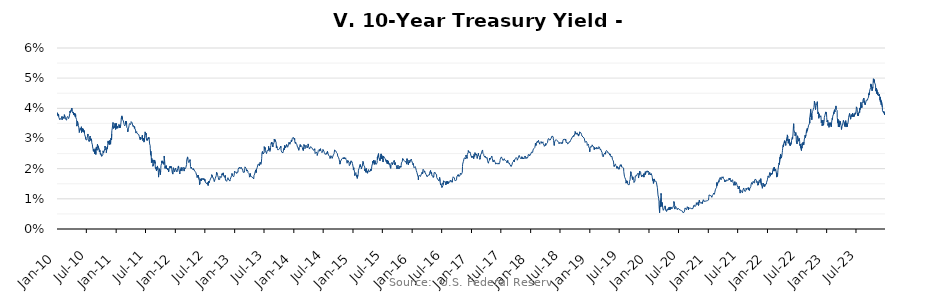
| Category | Series 0 |
|---|---|
| 2010-01-04 | 0.038 |
| 2010-01-05 | 0.038 |
| 2010-01-06 | 0.038 |
| 2010-01-07 | 0.038 |
| 2010-01-08 | 0.038 |
| 2010-01-11 | 0.038 |
| 2010-01-12 | 0.037 |
| 2010-01-13 | 0.038 |
| 2010-01-14 | 0.038 |
| 2010-01-15 | 0.037 |
| 2010-01-19 | 0.037 |
| 2010-01-20 | 0.037 |
| 2010-01-21 | 0.036 |
| 2010-01-22 | 0.036 |
| 2010-01-25 | 0.037 |
| 2010-01-26 | 0.036 |
| 2010-01-27 | 0.037 |
| 2010-01-28 | 0.037 |
| 2010-01-29 | 0.036 |
| 2010-02-01 | 0.037 |
| 2010-02-02 | 0.037 |
| 2010-02-03 | 0.037 |
| 2010-02-04 | 0.036 |
| 2010-02-05 | 0.036 |
| 2010-02-08 | 0.036 |
| 2010-02-09 | 0.037 |
| 2010-02-10 | 0.037 |
| 2010-02-11 | 0.037 |
| 2010-02-12 | 0.037 |
| 2010-02-16 | 0.037 |
| 2010-02-17 | 0.037 |
| 2010-02-18 | 0.038 |
| 2010-02-19 | 0.038 |
| 2010-02-22 | 0.038 |
| 2010-02-23 | 0.037 |
| 2010-02-24 | 0.037 |
| 2010-02-25 | 0.036 |
| 2010-02-26 | 0.036 |
| 2010-03-01 | 0.036 |
| 2010-03-02 | 0.036 |
| 2010-03-03 | 0.036 |
| 2010-03-04 | 0.036 |
| 2010-03-05 | 0.037 |
| 2010-03-08 | 0.037 |
| 2010-03-09 | 0.037 |
| 2010-03-10 | 0.037 |
| 2010-03-11 | 0.037 |
| 2010-03-12 | 0.037 |
| 2010-03-15 | 0.037 |
| 2010-03-16 | 0.037 |
| 2010-03-17 | 0.036 |
| 2010-03-18 | 0.037 |
| 2010-03-19 | 0.037 |
| 2010-03-22 | 0.037 |
| 2010-03-23 | 0.037 |
| 2010-03-24 | 0.038 |
| 2010-03-25 | 0.039 |
| 2010-03-26 | 0.039 |
| 2010-03-29 | 0.039 |
| 2010-03-30 | 0.039 |
| 2010-03-31 | 0.038 |
| 2010-04-01 | 0.039 |
| 2010-04-02 | 0.04 |
| 2010-04-05 | 0.04 |
| 2010-04-06 | 0.04 |
| 2010-04-07 | 0.039 |
| 2010-04-08 | 0.039 |
| 2010-04-09 | 0.039 |
| 2010-04-12 | 0.039 |
| 2010-04-13 | 0.038 |
| 2010-04-14 | 0.039 |
| 2010-04-15 | 0.039 |
| 2010-04-16 | 0.038 |
| 2010-04-19 | 0.038 |
| 2010-04-20 | 0.038 |
| 2010-04-21 | 0.038 |
| 2010-04-22 | 0.038 |
| 2010-04-23 | 0.038 |
| 2010-04-26 | 0.038 |
| 2010-04-27 | 0.037 |
| 2010-04-28 | 0.038 |
| 2010-04-29 | 0.038 |
| 2010-04-30 | 0.037 |
| 2010-05-03 | 0.037 |
| 2010-05-04 | 0.036 |
| 2010-05-05 | 0.036 |
| 2010-05-06 | 0.034 |
| 2010-05-07 | 0.034 |
| 2010-05-10 | 0.036 |
| 2010-05-11 | 0.036 |
| 2010-05-12 | 0.036 |
| 2010-05-13 | 0.036 |
| 2010-05-14 | 0.034 |
| 2010-05-17 | 0.035 |
| 2010-05-18 | 0.034 |
| 2010-05-19 | 0.034 |
| 2010-05-20 | 0.032 |
| 2010-05-21 | 0.032 |
| 2010-05-24 | 0.032 |
| 2010-05-25 | 0.032 |
| 2010-05-26 | 0.032 |
| 2010-05-27 | 0.033 |
| 2010-05-28 | 0.033 |
| 2010-06-01 | 0.033 |
| 2010-06-02 | 0.034 |
| 2010-06-03 | 0.034 |
| 2010-06-04 | 0.032 |
| 2010-06-07 | 0.032 |
| 2010-06-08 | 0.032 |
| 2010-06-09 | 0.032 |
| 2010-06-10 | 0.033 |
| 2010-06-11 | 0.032 |
| 2010-06-14 | 0.033 |
| 2010-06-15 | 0.033 |
| 2010-06-16 | 0.033 |
| 2010-06-17 | 0.032 |
| 2010-06-18 | 0.032 |
| 2010-06-21 | 0.033 |
| 2010-06-22 | 0.032 |
| 2010-06-23 | 0.031 |
| 2010-06-24 | 0.031 |
| 2010-06-25 | 0.031 |
| 2010-06-28 | 0.03 |
| 2010-06-29 | 0.03 |
| 2010-06-30 | 0.03 |
| 2010-07-01 | 0.03 |
| 2010-07-02 | 0.03 |
| 2010-07-06 | 0.03 |
| 2010-07-07 | 0.03 |
| 2010-07-08 | 0.03 |
| 2010-07-09 | 0.031 |
| 2010-07-12 | 0.031 |
| 2010-07-13 | 0.032 |
| 2010-07-14 | 0.031 |
| 2010-07-15 | 0.03 |
| 2010-07-16 | 0.03 |
| 2010-07-19 | 0.03 |
| 2010-07-20 | 0.03 |
| 2010-07-21 | 0.029 |
| 2010-07-22 | 0.03 |
| 2010-07-23 | 0.03 |
| 2010-07-26 | 0.03 |
| 2010-07-27 | 0.031 |
| 2010-07-28 | 0.03 |
| 2010-07-29 | 0.03 |
| 2010-07-30 | 0.029 |
| 2010-08-02 | 0.03 |
| 2010-08-03 | 0.029 |
| 2010-08-04 | 0.03 |
| 2010-08-05 | 0.029 |
| 2010-08-06 | 0.029 |
| 2010-08-09 | 0.029 |
| 2010-08-10 | 0.028 |
| 2010-08-11 | 0.027 |
| 2010-08-12 | 0.027 |
| 2010-08-13 | 0.027 |
| 2010-08-16 | 0.026 |
| 2010-08-17 | 0.026 |
| 2010-08-18 | 0.026 |
| 2010-08-19 | 0.026 |
| 2010-08-20 | 0.026 |
| 2010-08-23 | 0.026 |
| 2010-08-24 | 0.025 |
| 2010-08-25 | 0.025 |
| 2010-08-26 | 0.025 |
| 2010-08-27 | 0.027 |
| 2010-08-30 | 0.025 |
| 2010-08-31 | 0.025 |
| 2010-09-01 | 0.026 |
| 2010-09-02 | 0.026 |
| 2010-09-03 | 0.027 |
| 2010-09-07 | 0.026 |
| 2010-09-08 | 0.027 |
| 2010-09-09 | 0.028 |
| 2010-09-10 | 0.028 |
| 2010-09-13 | 0.027 |
| 2010-09-14 | 0.027 |
| 2010-09-15 | 0.027 |
| 2010-09-16 | 0.028 |
| 2010-09-17 | 0.028 |
| 2010-09-20 | 0.027 |
| 2010-09-21 | 0.026 |
| 2010-09-22 | 0.026 |
| 2010-09-23 | 0.026 |
| 2010-09-24 | 0.026 |
| 2010-09-27 | 0.025 |
| 2010-09-28 | 0.025 |
| 2010-09-29 | 0.025 |
| 2010-09-30 | 0.025 |
| 2010-10-01 | 0.025 |
| 2010-10-04 | 0.025 |
| 2010-10-05 | 0.025 |
| 2010-10-06 | 0.024 |
| 2010-10-07 | 0.024 |
| 2010-10-08 | 0.024 |
| 2010-10-12 | 0.024 |
| 2010-10-13 | 0.025 |
| 2010-10-14 | 0.025 |
| 2010-10-15 | 0.026 |
| 2010-10-18 | 0.025 |
| 2010-10-19 | 0.025 |
| 2010-10-20 | 0.025 |
| 2010-10-21 | 0.026 |
| 2010-10-22 | 0.026 |
| 2010-10-25 | 0.026 |
| 2010-10-26 | 0.027 |
| 2010-10-27 | 0.028 |
| 2010-10-28 | 0.027 |
| 2010-10-29 | 0.026 |
| 2010-11-01 | 0.027 |
| 2010-11-02 | 0.026 |
| 2010-11-03 | 0.027 |
| 2010-11-04 | 0.025 |
| 2010-11-05 | 0.026 |
| 2010-11-08 | 0.026 |
| 2010-11-09 | 0.027 |
| 2010-11-10 | 0.026 |
| 2010-11-12 | 0.028 |
| 2010-11-15 | 0.029 |
| 2010-11-16 | 0.028 |
| 2010-11-17 | 0.029 |
| 2010-11-18 | 0.029 |
| 2010-11-19 | 0.029 |
| 2010-11-22 | 0.028 |
| 2010-11-23 | 0.028 |
| 2010-11-24 | 0.029 |
| 2010-11-26 | 0.029 |
| 2010-11-29 | 0.028 |
| 2010-11-30 | 0.028 |
| 2010-12-01 | 0.03 |
| 2010-12-02 | 0.03 |
| 2010-12-03 | 0.03 |
| 2010-12-06 | 0.03 |
| 2010-12-07 | 0.032 |
| 2010-12-08 | 0.033 |
| 2010-12-09 | 0.032 |
| 2010-12-10 | 0.033 |
| 2010-12-13 | 0.033 |
| 2010-12-14 | 0.035 |
| 2010-12-15 | 0.035 |
| 2010-12-16 | 0.035 |
| 2010-12-17 | 0.033 |
| 2010-12-20 | 0.034 |
| 2010-12-21 | 0.034 |
| 2010-12-22 | 0.034 |
| 2010-12-23 | 0.034 |
| 2010-12-27 | 0.034 |
| 2010-12-28 | 0.035 |
| 2010-12-29 | 0.034 |
| 2010-12-30 | 0.034 |
| 2010-12-31 | 0.033 |
| 2011-01-03 | 0.034 |
| 2011-01-04 | 0.034 |
| 2011-01-05 | 0.035 |
| 2011-01-06 | 0.034 |
| 2011-01-07 | 0.033 |
| 2011-01-10 | 0.033 |
| 2011-01-11 | 0.034 |
| 2011-01-12 | 0.034 |
| 2011-01-13 | 0.033 |
| 2011-01-14 | 0.034 |
| 2011-01-18 | 0.034 |
| 2011-01-19 | 0.034 |
| 2011-01-20 | 0.035 |
| 2011-01-21 | 0.034 |
| 2011-01-24 | 0.034 |
| 2011-01-25 | 0.034 |
| 2011-01-26 | 0.034 |
| 2011-01-27 | 0.034 |
| 2011-01-28 | 0.034 |
| 2011-01-31 | 0.034 |
| 2011-02-01 | 0.035 |
| 2011-02-02 | 0.035 |
| 2011-02-03 | 0.036 |
| 2011-02-04 | 0.037 |
| 2011-02-07 | 0.037 |
| 2011-02-08 | 0.038 |
| 2011-02-09 | 0.036 |
| 2011-02-10 | 0.037 |
| 2011-02-11 | 0.036 |
| 2011-02-14 | 0.036 |
| 2011-02-15 | 0.036 |
| 2011-02-16 | 0.036 |
| 2011-02-17 | 0.036 |
| 2011-02-18 | 0.036 |
| 2011-02-22 | 0.035 |
| 2011-02-23 | 0.035 |
| 2011-02-24 | 0.035 |
| 2011-02-25 | 0.034 |
| 2011-02-28 | 0.034 |
| 2011-03-01 | 0.034 |
| 2011-03-02 | 0.035 |
| 2011-03-03 | 0.036 |
| 2011-03-04 | 0.035 |
| 2011-03-07 | 0.035 |
| 2011-03-08 | 0.036 |
| 2011-03-09 | 0.035 |
| 2011-03-10 | 0.034 |
| 2011-03-11 | 0.034 |
| 2011-03-14 | 0.034 |
| 2011-03-15 | 0.033 |
| 2011-03-16 | 0.032 |
| 2011-03-17 | 0.032 |
| 2011-03-18 | 0.033 |
| 2011-03-21 | 0.033 |
| 2011-03-22 | 0.033 |
| 2011-03-23 | 0.034 |
| 2011-03-24 | 0.034 |
| 2011-03-25 | 0.035 |
| 2011-03-28 | 0.035 |
| 2011-03-29 | 0.035 |
| 2011-03-30 | 0.035 |
| 2011-03-31 | 0.035 |
| 2011-04-01 | 0.035 |
| 2011-04-04 | 0.034 |
| 2011-04-05 | 0.035 |
| 2011-04-06 | 0.036 |
| 2011-04-07 | 0.036 |
| 2011-04-08 | 0.036 |
| 2011-04-11 | 0.036 |
| 2011-04-12 | 0.035 |
| 2011-04-13 | 0.035 |
| 2011-04-14 | 0.035 |
| 2011-04-15 | 0.034 |
| 2011-04-18 | 0.034 |
| 2011-04-19 | 0.034 |
| 2011-04-20 | 0.034 |
| 2011-04-21 | 0.034 |
| 2011-04-25 | 0.034 |
| 2011-04-26 | 0.033 |
| 2011-04-27 | 0.034 |
| 2011-04-28 | 0.033 |
| 2011-04-29 | 0.033 |
| 2011-05-02 | 0.033 |
| 2011-05-03 | 0.033 |
| 2011-05-04 | 0.032 |
| 2011-05-05 | 0.032 |
| 2011-05-06 | 0.032 |
| 2011-05-09 | 0.032 |
| 2011-05-10 | 0.032 |
| 2011-05-11 | 0.032 |
| 2011-05-12 | 0.032 |
| 2011-05-13 | 0.032 |
| 2011-05-16 | 0.032 |
| 2011-05-17 | 0.031 |
| 2011-05-18 | 0.032 |
| 2011-05-19 | 0.032 |
| 2011-05-20 | 0.032 |
| 2011-05-23 | 0.031 |
| 2011-05-24 | 0.031 |
| 2011-05-25 | 0.031 |
| 2011-05-26 | 0.031 |
| 2011-05-27 | 0.031 |
| 2011-05-31 | 0.03 |
| 2011-06-01 | 0.03 |
| 2011-06-02 | 0.03 |
| 2011-06-03 | 0.03 |
| 2011-06-06 | 0.03 |
| 2011-06-07 | 0.03 |
| 2011-06-08 | 0.03 |
| 2011-06-09 | 0.03 |
| 2011-06-10 | 0.03 |
| 2011-06-13 | 0.03 |
| 2011-06-14 | 0.031 |
| 2011-06-15 | 0.03 |
| 2011-06-16 | 0.029 |
| 2011-06-17 | 0.029 |
| 2011-06-20 | 0.03 |
| 2011-06-21 | 0.03 |
| 2011-06-22 | 0.03 |
| 2011-06-23 | 0.029 |
| 2011-06-24 | 0.029 |
| 2011-06-27 | 0.03 |
| 2011-06-28 | 0.03 |
| 2011-06-29 | 0.031 |
| 2011-06-30 | 0.032 |
| 2011-07-01 | 0.032 |
| 2011-07-05 | 0.032 |
| 2011-07-06 | 0.031 |
| 2011-07-07 | 0.032 |
| 2011-07-08 | 0.03 |
| 2011-07-11 | 0.029 |
| 2011-07-12 | 0.029 |
| 2011-07-13 | 0.029 |
| 2011-07-14 | 0.03 |
| 2011-07-15 | 0.029 |
| 2011-07-18 | 0.029 |
| 2011-07-19 | 0.029 |
| 2011-07-20 | 0.03 |
| 2011-07-21 | 0.03 |
| 2011-07-22 | 0.03 |
| 2011-07-25 | 0.03 |
| 2011-07-26 | 0.03 |
| 2011-07-27 | 0.03 |
| 2011-07-28 | 0.03 |
| 2011-07-29 | 0.028 |
| 2011-08-01 | 0.028 |
| 2011-08-02 | 0.027 |
| 2011-08-03 | 0.026 |
| 2011-08-04 | 0.025 |
| 2011-08-05 | 0.026 |
| 2011-08-08 | 0.024 |
| 2011-08-09 | 0.022 |
| 2011-08-10 | 0.022 |
| 2011-08-11 | 0.023 |
| 2011-08-12 | 0.022 |
| 2011-08-15 | 0.023 |
| 2011-08-16 | 0.022 |
| 2011-08-17 | 0.022 |
| 2011-08-18 | 0.021 |
| 2011-08-19 | 0.021 |
| 2011-08-22 | 0.021 |
| 2011-08-23 | 0.022 |
| 2011-08-24 | 0.023 |
| 2011-08-25 | 0.022 |
| 2011-08-26 | 0.022 |
| 2011-08-29 | 0.023 |
| 2011-08-30 | 0.022 |
| 2011-08-31 | 0.022 |
| 2011-09-01 | 0.022 |
| 2011-09-02 | 0.02 |
| 2011-09-06 | 0.02 |
| 2011-09-07 | 0.02 |
| 2011-09-08 | 0.02 |
| 2011-09-09 | 0.019 |
| 2011-09-12 | 0.019 |
| 2011-09-13 | 0.02 |
| 2011-09-14 | 0.02 |
| 2011-09-15 | 0.021 |
| 2011-09-16 | 0.021 |
| 2011-09-19 | 0.02 |
| 2011-09-20 | 0.02 |
| 2011-09-21 | 0.019 |
| 2011-09-22 | 0.017 |
| 2011-09-23 | 0.018 |
| 2011-09-26 | 0.019 |
| 2011-09-27 | 0.02 |
| 2011-09-28 | 0.02 |
| 2011-09-29 | 0.02 |
| 2011-09-30 | 0.019 |
| 2011-10-03 | 0.018 |
| 2011-10-04 | 0.018 |
| 2011-10-05 | 0.019 |
| 2011-10-06 | 0.02 |
| 2011-10-07 | 0.021 |
| 2011-10-11 | 0.022 |
| 2011-10-12 | 0.022 |
| 2011-10-13 | 0.022 |
| 2011-10-14 | 0.023 |
| 2011-10-17 | 0.022 |
| 2011-10-18 | 0.022 |
| 2011-10-19 | 0.022 |
| 2011-10-20 | 0.022 |
| 2011-10-21 | 0.022 |
| 2011-10-24 | 0.022 |
| 2011-10-25 | 0.021 |
| 2011-10-26 | 0.022 |
| 2011-10-27 | 0.024 |
| 2011-10-28 | 0.023 |
| 2011-10-31 | 0.022 |
| 2011-11-01 | 0.02 |
| 2011-11-02 | 0.02 |
| 2011-11-03 | 0.021 |
| 2011-11-04 | 0.021 |
| 2011-11-07 | 0.02 |
| 2011-11-08 | 0.021 |
| 2011-11-09 | 0.02 |
| 2011-11-10 | 0.02 |
| 2011-11-14 | 0.02 |
| 2011-11-15 | 0.021 |
| 2011-11-16 | 0.02 |
| 2011-11-17 | 0.02 |
| 2011-11-18 | 0.02 |
| 2011-11-21 | 0.02 |
| 2011-11-22 | 0.019 |
| 2011-11-23 | 0.019 |
| 2011-11-25 | 0.02 |
| 2011-11-28 | 0.02 |
| 2011-11-29 | 0.02 |
| 2011-11-30 | 0.021 |
| 2011-12-01 | 0.021 |
| 2011-12-02 | 0.02 |
| 2011-12-05 | 0.02 |
| 2011-12-06 | 0.021 |
| 2011-12-07 | 0.02 |
| 2011-12-08 | 0.02 |
| 2011-12-09 | 0.021 |
| 2011-12-12 | 0.02 |
| 2011-12-13 | 0.02 |
| 2011-12-14 | 0.019 |
| 2011-12-15 | 0.019 |
| 2011-12-16 | 0.019 |
| 2011-12-19 | 0.018 |
| 2011-12-20 | 0.019 |
| 2011-12-21 | 0.02 |
| 2011-12-22 | 0.02 |
| 2011-12-23 | 0.02 |
| 2011-12-27 | 0.02 |
| 2011-12-28 | 0.019 |
| 2011-12-29 | 0.019 |
| 2011-12-30 | 0.019 |
| 2012-01-02 | 0.019 |
| 2012-01-03 | 0.02 |
| 2012-01-04 | 0.02 |
| 2012-01-05 | 0.02 |
| 2012-01-06 | 0.02 |
| 2012-01-09 | 0.02 |
| 2012-01-10 | 0.02 |
| 2012-01-11 | 0.019 |
| 2012-01-12 | 0.019 |
| 2012-01-13 | 0.019 |
| 2012-01-16 | 0.019 |
| 2012-01-17 | 0.019 |
| 2012-01-18 | 0.019 |
| 2012-01-19 | 0.02 |
| 2012-01-20 | 0.02 |
| 2012-01-23 | 0.021 |
| 2012-01-24 | 0.021 |
| 2012-01-25 | 0.02 |
| 2012-01-26 | 0.02 |
| 2012-01-27 | 0.019 |
| 2012-01-30 | 0.019 |
| 2012-01-31 | 0.018 |
| 2012-02-01 | 0.019 |
| 2012-02-02 | 0.019 |
| 2012-02-03 | 0.02 |
| 2012-02-06 | 0.019 |
| 2012-02-07 | 0.02 |
| 2012-02-08 | 0.02 |
| 2012-02-09 | 0.02 |
| 2012-02-10 | 0.02 |
| 2012-02-13 | 0.02 |
| 2012-02-14 | 0.019 |
| 2012-02-15 | 0.019 |
| 2012-02-16 | 0.02 |
| 2012-02-17 | 0.02 |
| 2012-02-20 | 0.02 |
| 2012-02-21 | 0.02 |
| 2012-02-22 | 0.02 |
| 2012-02-23 | 0.02 |
| 2012-02-24 | 0.02 |
| 2012-02-27 | 0.019 |
| 2012-02-28 | 0.019 |
| 2012-02-29 | 0.02 |
| 2012-03-01 | 0.02 |
| 2012-03-02 | 0.02 |
| 2012-03-05 | 0.02 |
| 2012-03-06 | 0.02 |
| 2012-03-07 | 0.02 |
| 2012-03-08 | 0.02 |
| 2012-03-09 | 0.02 |
| 2012-03-12 | 0.02 |
| 2012-03-13 | 0.021 |
| 2012-03-14 | 0.023 |
| 2012-03-15 | 0.023 |
| 2012-03-16 | 0.023 |
| 2012-03-19 | 0.024 |
| 2012-03-20 | 0.024 |
| 2012-03-21 | 0.023 |
| 2012-03-22 | 0.023 |
| 2012-03-23 | 0.022 |
| 2012-03-26 | 0.023 |
| 2012-03-27 | 0.022 |
| 2012-03-28 | 0.022 |
| 2012-03-29 | 0.022 |
| 2012-03-30 | 0.022 |
| 2012-04-02 | 0.022 |
| 2012-04-03 | 0.023 |
| 2012-04-04 | 0.022 |
| 2012-04-05 | 0.022 |
| 2012-04-06 | 0.021 |
| 2012-04-09 | 0.021 |
| 2012-04-10 | 0.02 |
| 2012-04-11 | 0.02 |
| 2012-04-12 | 0.021 |
| 2012-04-13 | 0.02 |
| 2012-04-16 | 0.02 |
| 2012-04-17 | 0.02 |
| 2012-04-18 | 0.02 |
| 2012-04-19 | 0.02 |
| 2012-04-20 | 0.02 |
| 2012-04-23 | 0.02 |
| 2012-04-24 | 0.02 |
| 2012-04-25 | 0.02 |
| 2012-04-26 | 0.02 |
| 2012-04-27 | 0.02 |
| 2012-04-30 | 0.02 |
| 2012-05-01 | 0.02 |
| 2012-05-02 | 0.02 |
| 2012-05-03 | 0.02 |
| 2012-05-04 | 0.019 |
| 2012-05-07 | 0.019 |
| 2012-05-08 | 0.019 |
| 2012-05-09 | 0.019 |
| 2012-05-10 | 0.019 |
| 2012-05-11 | 0.018 |
| 2012-05-14 | 0.018 |
| 2012-05-15 | 0.018 |
| 2012-05-16 | 0.018 |
| 2012-05-17 | 0.017 |
| 2012-05-18 | 0.017 |
| 2012-05-21 | 0.018 |
| 2012-05-22 | 0.018 |
| 2012-05-23 | 0.017 |
| 2012-05-24 | 0.018 |
| 2012-05-25 | 0.018 |
| 2012-05-28 | 0.018 |
| 2012-05-29 | 0.017 |
| 2012-05-30 | 0.016 |
| 2012-05-31 | 0.016 |
| 2012-06-01 | 0.015 |
| 2012-06-04 | 0.015 |
| 2012-06-05 | 0.016 |
| 2012-06-06 | 0.017 |
| 2012-06-07 | 0.017 |
| 2012-06-08 | 0.016 |
| 2012-06-11 | 0.016 |
| 2012-06-12 | 0.017 |
| 2012-06-13 | 0.016 |
| 2012-06-14 | 0.016 |
| 2012-06-15 | 0.016 |
| 2012-06-18 | 0.016 |
| 2012-06-19 | 0.016 |
| 2012-06-20 | 0.016 |
| 2012-06-21 | 0.016 |
| 2012-06-22 | 0.017 |
| 2012-06-25 | 0.016 |
| 2012-06-26 | 0.017 |
| 2012-06-27 | 0.016 |
| 2012-06-28 | 0.016 |
| 2012-06-29 | 0.017 |
| 2012-07-02 | 0.016 |
| 2012-07-03 | 0.016 |
| 2012-07-04 | 0.016 |
| 2012-07-05 | 0.016 |
| 2012-07-06 | 0.016 |
| 2012-07-09 | 0.015 |
| 2012-07-10 | 0.015 |
| 2012-07-11 | 0.015 |
| 2012-07-12 | 0.015 |
| 2012-07-13 | 0.015 |
| 2012-07-16 | 0.015 |
| 2012-07-17 | 0.015 |
| 2012-07-18 | 0.015 |
| 2012-07-19 | 0.015 |
| 2012-07-20 | 0.015 |
| 2012-07-23 | 0.015 |
| 2012-07-24 | 0.014 |
| 2012-07-25 | 0.014 |
| 2012-07-26 | 0.014 |
| 2012-07-27 | 0.016 |
| 2012-07-30 | 0.015 |
| 2012-07-31 | 0.015 |
| 2012-08-01 | 0.016 |
| 2012-08-02 | 0.015 |
| 2012-08-03 | 0.016 |
| 2012-08-06 | 0.016 |
| 2012-08-07 | 0.017 |
| 2012-08-08 | 0.017 |
| 2012-08-09 | 0.017 |
| 2012-08-10 | 0.016 |
| 2012-08-13 | 0.016 |
| 2012-08-14 | 0.017 |
| 2012-08-15 | 0.018 |
| 2012-08-16 | 0.018 |
| 2012-08-17 | 0.018 |
| 2012-08-20 | 0.018 |
| 2012-08-21 | 0.018 |
| 2012-08-22 | 0.017 |
| 2012-08-23 | 0.017 |
| 2012-08-24 | 0.017 |
| 2012-08-27 | 0.016 |
| 2012-08-28 | 0.016 |
| 2012-08-29 | 0.017 |
| 2012-08-30 | 0.016 |
| 2012-08-31 | 0.016 |
| 2012-09-03 | 0.016 |
| 2012-09-04 | 0.016 |
| 2012-09-05 | 0.016 |
| 2012-09-06 | 0.017 |
| 2012-09-07 | 0.017 |
| 2012-09-10 | 0.017 |
| 2012-09-11 | 0.017 |
| 2012-09-12 | 0.018 |
| 2012-09-13 | 0.018 |
| 2012-09-14 | 0.019 |
| 2012-09-17 | 0.019 |
| 2012-09-18 | 0.018 |
| 2012-09-19 | 0.018 |
| 2012-09-20 | 0.018 |
| 2012-09-21 | 0.018 |
| 2012-09-24 | 0.017 |
| 2012-09-25 | 0.017 |
| 2012-09-26 | 0.016 |
| 2012-09-27 | 0.017 |
| 2012-09-28 | 0.016 |
| 2012-10-01 | 0.016 |
| 2012-10-02 | 0.016 |
| 2012-10-03 | 0.016 |
| 2012-10-04 | 0.017 |
| 2012-10-05 | 0.018 |
| 2012-10-08 | 0.018 |
| 2012-10-09 | 0.017 |
| 2012-10-10 | 0.017 |
| 2012-10-11 | 0.017 |
| 2012-10-12 | 0.017 |
| 2012-10-15 | 0.017 |
| 2012-10-16 | 0.018 |
| 2012-10-17 | 0.018 |
| 2012-10-18 | 0.019 |
| 2012-10-19 | 0.018 |
| 2012-10-22 | 0.018 |
| 2012-10-23 | 0.018 |
| 2012-10-24 | 0.018 |
| 2012-10-25 | 0.019 |
| 2012-10-26 | 0.018 |
| 2012-10-29 | 0.017 |
| 2012-10-30 | 0.017 |
| 2012-10-31 | 0.017 |
| 2012-11-01 | 0.018 |
| 2012-11-02 | 0.018 |
| 2012-11-05 | 0.017 |
| 2012-11-06 | 0.018 |
| 2012-11-07 | 0.017 |
| 2012-11-08 | 0.016 |
| 2012-11-09 | 0.016 |
| 2012-11-12 | 0.016 |
| 2012-11-13 | 0.016 |
| 2012-11-14 | 0.016 |
| 2012-11-15 | 0.016 |
| 2012-11-16 | 0.016 |
| 2012-11-19 | 0.016 |
| 2012-11-20 | 0.017 |
| 2012-11-21 | 0.017 |
| 2012-11-22 | 0.017 |
| 2012-11-23 | 0.017 |
| 2012-11-26 | 0.017 |
| 2012-11-27 | 0.016 |
| 2012-11-28 | 0.016 |
| 2012-11-29 | 0.016 |
| 2012-11-30 | 0.016 |
| 2012-12-03 | 0.016 |
| 2012-12-04 | 0.016 |
| 2012-12-05 | 0.016 |
| 2012-12-06 | 0.016 |
| 2012-12-07 | 0.016 |
| 2012-12-10 | 0.016 |
| 2012-12-11 | 0.017 |
| 2012-12-12 | 0.017 |
| 2012-12-13 | 0.017 |
| 2012-12-14 | 0.017 |
| 2012-12-17 | 0.018 |
| 2012-12-18 | 0.018 |
| 2012-12-19 | 0.018 |
| 2012-12-20 | 0.018 |
| 2012-12-21 | 0.018 |
| 2012-12-24 | 0.018 |
| 2012-12-25 | 0.018 |
| 2012-12-26 | 0.018 |
| 2012-12-27 | 0.017 |
| 2012-12-28 | 0.017 |
| 2012-12-31 | 0.018 |
| 2013-01-01 | 0.018 |
| 2013-01-02 | 0.019 |
| 2013-01-03 | 0.019 |
| 2013-01-04 | 0.019 |
| 2013-01-07 | 0.019 |
| 2013-01-08 | 0.019 |
| 2013-01-09 | 0.019 |
| 2013-01-10 | 0.019 |
| 2013-01-11 | 0.019 |
| 2013-01-14 | 0.019 |
| 2013-01-15 | 0.019 |
| 2013-01-16 | 0.018 |
| 2013-01-17 | 0.019 |
| 2013-01-18 | 0.019 |
| 2013-01-21 | 0.019 |
| 2013-01-22 | 0.019 |
| 2013-01-23 | 0.019 |
| 2013-01-24 | 0.019 |
| 2013-01-25 | 0.02 |
| 2013-01-28 | 0.02 |
| 2013-01-29 | 0.02 |
| 2013-01-30 | 0.02 |
| 2013-01-31 | 0.02 |
| 2013-02-01 | 0.02 |
| 2013-02-04 | 0.02 |
| 2013-02-05 | 0.02 |
| 2013-02-06 | 0.02 |
| 2013-02-07 | 0.02 |
| 2013-02-08 | 0.02 |
| 2013-02-11 | 0.02 |
| 2013-02-12 | 0.02 |
| 2013-02-13 | 0.02 |
| 2013-02-14 | 0.02 |
| 2013-02-15 | 0.02 |
| 2013-02-18 | 0.02 |
| 2013-02-19 | 0.02 |
| 2013-02-20 | 0.02 |
| 2013-02-21 | 0.02 |
| 2013-02-22 | 0.02 |
| 2013-02-25 | 0.019 |
| 2013-02-26 | 0.019 |
| 2013-02-27 | 0.019 |
| 2013-02-28 | 0.019 |
| 2013-03-01 | 0.019 |
| 2013-03-04 | 0.019 |
| 2013-03-05 | 0.019 |
| 2013-03-06 | 0.02 |
| 2013-03-07 | 0.02 |
| 2013-03-08 | 0.021 |
| 2013-03-11 | 0.021 |
| 2013-03-12 | 0.02 |
| 2013-03-13 | 0.02 |
| 2013-03-14 | 0.02 |
| 2013-03-15 | 0.02 |
| 2013-03-18 | 0.02 |
| 2013-03-19 | 0.019 |
| 2013-03-20 | 0.02 |
| 2013-03-21 | 0.02 |
| 2013-03-22 | 0.019 |
| 2013-03-25 | 0.019 |
| 2013-03-26 | 0.019 |
| 2013-03-27 | 0.019 |
| 2013-03-28 | 0.019 |
| 2013-03-29 | 0.019 |
| 2013-04-01 | 0.019 |
| 2013-04-02 | 0.019 |
| 2013-04-03 | 0.018 |
| 2013-04-04 | 0.018 |
| 2013-04-05 | 0.017 |
| 2013-04-08 | 0.018 |
| 2013-04-09 | 0.018 |
| 2013-04-10 | 0.018 |
| 2013-04-11 | 0.018 |
| 2013-04-12 | 0.018 |
| 2013-04-15 | 0.017 |
| 2013-04-16 | 0.018 |
| 2013-04-17 | 0.017 |
| 2013-04-18 | 0.017 |
| 2013-04-19 | 0.017 |
| 2013-04-22 | 0.017 |
| 2013-04-23 | 0.017 |
| 2013-04-24 | 0.017 |
| 2013-04-25 | 0.017 |
| 2013-04-26 | 0.017 |
| 2013-04-29 | 0.017 |
| 2013-04-30 | 0.017 |
| 2013-05-01 | 0.017 |
| 2013-05-02 | 0.017 |
| 2013-05-03 | 0.018 |
| 2013-05-06 | 0.018 |
| 2013-05-07 | 0.018 |
| 2013-05-08 | 0.018 |
| 2013-05-09 | 0.018 |
| 2013-05-10 | 0.019 |
| 2013-05-13 | 0.019 |
| 2013-05-14 | 0.02 |
| 2013-05-15 | 0.019 |
| 2013-05-16 | 0.019 |
| 2013-05-17 | 0.02 |
| 2013-05-20 | 0.02 |
| 2013-05-21 | 0.019 |
| 2013-05-22 | 0.02 |
| 2013-05-23 | 0.02 |
| 2013-05-24 | 0.02 |
| 2013-05-27 | 0.02 |
| 2013-05-28 | 0.022 |
| 2013-05-29 | 0.021 |
| 2013-05-30 | 0.021 |
| 2013-05-31 | 0.022 |
| 2013-06-03 | 0.021 |
| 2013-06-04 | 0.021 |
| 2013-06-05 | 0.021 |
| 2013-06-06 | 0.021 |
| 2013-06-07 | 0.022 |
| 2013-06-10 | 0.022 |
| 2013-06-11 | 0.022 |
| 2013-06-12 | 0.022 |
| 2013-06-13 | 0.022 |
| 2013-06-14 | 0.021 |
| 2013-06-17 | 0.022 |
| 2013-06-18 | 0.022 |
| 2013-06-19 | 0.023 |
| 2013-06-20 | 0.024 |
| 2013-06-21 | 0.025 |
| 2013-06-24 | 0.026 |
| 2013-06-25 | 0.026 |
| 2013-06-26 | 0.026 |
| 2013-06-27 | 0.025 |
| 2013-06-28 | 0.025 |
| 2013-07-01 | 0.025 |
| 2013-07-02 | 0.025 |
| 2013-07-03 | 0.025 |
| 2013-07-04 | 0.025 |
| 2013-07-05 | 0.027 |
| 2013-07-08 | 0.026 |
| 2013-07-09 | 0.026 |
| 2013-07-10 | 0.027 |
| 2013-07-11 | 0.026 |
| 2013-07-12 | 0.026 |
| 2013-07-15 | 0.026 |
| 2013-07-16 | 0.026 |
| 2013-07-17 | 0.025 |
| 2013-07-18 | 0.026 |
| 2013-07-19 | 0.025 |
| 2013-07-22 | 0.025 |
| 2013-07-23 | 0.025 |
| 2013-07-24 | 0.026 |
| 2013-07-25 | 0.026 |
| 2013-07-26 | 0.026 |
| 2013-07-29 | 0.026 |
| 2013-07-30 | 0.026 |
| 2013-07-31 | 0.026 |
| 2013-08-01 | 0.027 |
| 2013-08-02 | 0.026 |
| 2013-08-05 | 0.027 |
| 2013-08-06 | 0.027 |
| 2013-08-07 | 0.026 |
| 2013-08-08 | 0.026 |
| 2013-08-09 | 0.026 |
| 2013-08-12 | 0.026 |
| 2013-08-13 | 0.027 |
| 2013-08-14 | 0.027 |
| 2013-08-15 | 0.028 |
| 2013-08-16 | 0.028 |
| 2013-08-19 | 0.029 |
| 2013-08-20 | 0.028 |
| 2013-08-21 | 0.029 |
| 2013-08-22 | 0.029 |
| 2013-08-23 | 0.028 |
| 2013-08-26 | 0.028 |
| 2013-08-27 | 0.027 |
| 2013-08-28 | 0.028 |
| 2013-08-29 | 0.028 |
| 2013-08-30 | 0.028 |
| 2013-09-02 | 0.028 |
| 2013-09-03 | 0.029 |
| 2013-09-04 | 0.029 |
| 2013-09-05 | 0.03 |
| 2013-09-06 | 0.029 |
| 2013-09-09 | 0.029 |
| 2013-09-10 | 0.03 |
| 2013-09-11 | 0.029 |
| 2013-09-12 | 0.029 |
| 2013-09-13 | 0.029 |
| 2013-09-16 | 0.029 |
| 2013-09-17 | 0.029 |
| 2013-09-18 | 0.027 |
| 2013-09-19 | 0.028 |
| 2013-09-20 | 0.028 |
| 2013-09-23 | 0.027 |
| 2013-09-24 | 0.027 |
| 2013-09-25 | 0.026 |
| 2013-09-26 | 0.027 |
| 2013-09-27 | 0.026 |
| 2013-09-30 | 0.026 |
| 2013-10-01 | 0.027 |
| 2013-10-02 | 0.026 |
| 2013-10-03 | 0.026 |
| 2013-10-04 | 0.027 |
| 2013-10-07 | 0.026 |
| 2013-10-08 | 0.027 |
| 2013-10-09 | 0.027 |
| 2013-10-10 | 0.027 |
| 2013-10-11 | 0.027 |
| 2013-10-14 | 0.027 |
| 2013-10-15 | 0.028 |
| 2013-10-16 | 0.027 |
| 2013-10-17 | 0.026 |
| 2013-10-18 | 0.026 |
| 2013-10-21 | 0.026 |
| 2013-10-22 | 0.025 |
| 2013-10-23 | 0.025 |
| 2013-10-24 | 0.025 |
| 2013-10-25 | 0.025 |
| 2013-10-28 | 0.025 |
| 2013-10-29 | 0.025 |
| 2013-10-30 | 0.026 |
| 2013-10-31 | 0.026 |
| 2013-11-01 | 0.026 |
| 2013-11-04 | 0.026 |
| 2013-11-05 | 0.027 |
| 2013-11-06 | 0.027 |
| 2013-11-07 | 0.026 |
| 2013-11-08 | 0.028 |
| 2013-11-11 | 0.028 |
| 2013-11-12 | 0.028 |
| 2013-11-13 | 0.028 |
| 2013-11-14 | 0.027 |
| 2013-11-15 | 0.027 |
| 2013-11-18 | 0.027 |
| 2013-11-19 | 0.027 |
| 2013-11-20 | 0.028 |
| 2013-11-21 | 0.028 |
| 2013-11-22 | 0.028 |
| 2013-11-25 | 0.027 |
| 2013-11-26 | 0.027 |
| 2013-11-27 | 0.027 |
| 2013-11-28 | 0.027 |
| 2013-11-29 | 0.028 |
| 2013-12-02 | 0.028 |
| 2013-12-03 | 0.028 |
| 2013-12-04 | 0.028 |
| 2013-12-05 | 0.029 |
| 2013-12-06 | 0.029 |
| 2013-12-09 | 0.029 |
| 2013-12-10 | 0.028 |
| 2013-12-11 | 0.029 |
| 2013-12-12 | 0.029 |
| 2013-12-13 | 0.029 |
| 2013-12-16 | 0.029 |
| 2013-12-17 | 0.028 |
| 2013-12-18 | 0.029 |
| 2013-12-19 | 0.029 |
| 2013-12-20 | 0.029 |
| 2013-12-23 | 0.029 |
| 2013-12-24 | 0.03 |
| 2013-12-25 | 0.03 |
| 2013-12-26 | 0.03 |
| 2013-12-27 | 0.03 |
| 2013-12-30 | 0.03 |
| 2013-12-31 | 0.03 |
| 2014-01-01 | 0.03 |
| 2014-01-02 | 0.03 |
| 2014-01-03 | 0.03 |
| 2014-01-06 | 0.03 |
| 2014-01-07 | 0.03 |
| 2014-01-08 | 0.03 |
| 2014-01-09 | 0.03 |
| 2014-01-10 | 0.029 |
| 2014-01-13 | 0.028 |
| 2014-01-14 | 0.029 |
| 2014-01-15 | 0.029 |
| 2014-01-16 | 0.029 |
| 2014-01-17 | 0.028 |
| 2014-01-20 | 0.028 |
| 2014-01-21 | 0.028 |
| 2014-01-22 | 0.029 |
| 2014-01-23 | 0.028 |
| 2014-01-24 | 0.028 |
| 2014-01-27 | 0.028 |
| 2014-01-28 | 0.028 |
| 2014-01-29 | 0.027 |
| 2014-01-30 | 0.027 |
| 2014-01-31 | 0.027 |
| 2014-02-03 | 0.026 |
| 2014-02-04 | 0.026 |
| 2014-02-05 | 0.027 |
| 2014-02-06 | 0.027 |
| 2014-02-07 | 0.027 |
| 2014-02-10 | 0.027 |
| 2014-02-11 | 0.028 |
| 2014-02-12 | 0.028 |
| 2014-02-13 | 0.027 |
| 2014-02-14 | 0.028 |
| 2014-02-17 | 0.028 |
| 2014-02-18 | 0.027 |
| 2014-02-19 | 0.027 |
| 2014-02-20 | 0.028 |
| 2014-02-21 | 0.027 |
| 2014-02-24 | 0.028 |
| 2014-02-25 | 0.027 |
| 2014-02-26 | 0.027 |
| 2014-02-27 | 0.026 |
| 2014-02-28 | 0.027 |
| 2014-03-03 | 0.026 |
| 2014-03-04 | 0.027 |
| 2014-03-05 | 0.027 |
| 2014-03-06 | 0.027 |
| 2014-03-07 | 0.028 |
| 2014-03-10 | 0.028 |
| 2014-03-11 | 0.028 |
| 2014-03-12 | 0.027 |
| 2014-03-13 | 0.027 |
| 2014-03-14 | 0.026 |
| 2014-03-17 | 0.027 |
| 2014-03-18 | 0.027 |
| 2014-03-19 | 0.028 |
| 2014-03-20 | 0.028 |
| 2014-03-21 | 0.028 |
| 2014-03-24 | 0.027 |
| 2014-03-25 | 0.028 |
| 2014-03-26 | 0.027 |
| 2014-03-27 | 0.027 |
| 2014-03-28 | 0.027 |
| 2014-03-31 | 0.027 |
| 2014-04-01 | 0.028 |
| 2014-04-02 | 0.028 |
| 2014-04-03 | 0.028 |
| 2014-04-04 | 0.027 |
| 2014-04-07 | 0.027 |
| 2014-04-08 | 0.027 |
| 2014-04-09 | 0.027 |
| 2014-04-10 | 0.026 |
| 2014-04-11 | 0.026 |
| 2014-04-14 | 0.026 |
| 2014-04-15 | 0.026 |
| 2014-04-16 | 0.026 |
| 2014-04-17 | 0.027 |
| 2014-04-18 | 0.027 |
| 2014-04-21 | 0.027 |
| 2014-04-22 | 0.027 |
| 2014-04-23 | 0.027 |
| 2014-04-24 | 0.027 |
| 2014-04-25 | 0.027 |
| 2014-04-28 | 0.027 |
| 2014-04-29 | 0.027 |
| 2014-04-30 | 0.027 |
| 2014-05-01 | 0.026 |
| 2014-05-02 | 0.026 |
| 2014-05-05 | 0.026 |
| 2014-05-06 | 0.026 |
| 2014-05-07 | 0.026 |
| 2014-05-08 | 0.026 |
| 2014-05-09 | 0.026 |
| 2014-05-12 | 0.027 |
| 2014-05-13 | 0.026 |
| 2014-05-14 | 0.025 |
| 2014-05-15 | 0.025 |
| 2014-05-16 | 0.025 |
| 2014-05-19 | 0.025 |
| 2014-05-20 | 0.025 |
| 2014-05-21 | 0.025 |
| 2014-05-22 | 0.026 |
| 2014-05-23 | 0.025 |
| 2014-05-26 | 0.025 |
| 2014-05-27 | 0.025 |
| 2014-05-28 | 0.024 |
| 2014-05-29 | 0.024 |
| 2014-05-30 | 0.025 |
| 2014-06-02 | 0.025 |
| 2014-06-03 | 0.026 |
| 2014-06-04 | 0.026 |
| 2014-06-05 | 0.026 |
| 2014-06-06 | 0.026 |
| 2014-06-09 | 0.026 |
| 2014-06-10 | 0.026 |
| 2014-06-11 | 0.026 |
| 2014-06-12 | 0.026 |
| 2014-06-13 | 0.026 |
| 2014-06-16 | 0.026 |
| 2014-06-17 | 0.027 |
| 2014-06-18 | 0.026 |
| 2014-06-19 | 0.026 |
| 2014-06-20 | 0.026 |
| 2014-06-23 | 0.026 |
| 2014-06-24 | 0.026 |
| 2014-06-25 | 0.026 |
| 2014-06-26 | 0.025 |
| 2014-06-27 | 0.025 |
| 2014-06-30 | 0.025 |
| 2014-07-01 | 0.026 |
| 2014-07-02 | 0.026 |
| 2014-07-03 | 0.026 |
| 2014-07-04 | 0.026 |
| 2014-07-07 | 0.026 |
| 2014-07-08 | 0.026 |
| 2014-07-09 | 0.026 |
| 2014-07-10 | 0.026 |
| 2014-07-11 | 0.025 |
| 2014-07-14 | 0.026 |
| 2014-07-15 | 0.026 |
| 2014-07-16 | 0.026 |
| 2014-07-17 | 0.025 |
| 2014-07-18 | 0.025 |
| 2014-07-21 | 0.025 |
| 2014-07-22 | 0.025 |
| 2014-07-23 | 0.025 |
| 2014-07-24 | 0.025 |
| 2014-07-25 | 0.025 |
| 2014-07-28 | 0.025 |
| 2014-07-29 | 0.025 |
| 2014-07-30 | 0.026 |
| 2014-07-31 | 0.026 |
| 2014-08-01 | 0.025 |
| 2014-08-04 | 0.025 |
| 2014-08-05 | 0.025 |
| 2014-08-06 | 0.025 |
| 2014-08-07 | 0.024 |
| 2014-08-08 | 0.024 |
| 2014-08-11 | 0.024 |
| 2014-08-12 | 0.025 |
| 2014-08-13 | 0.024 |
| 2014-08-14 | 0.024 |
| 2014-08-15 | 0.023 |
| 2014-08-18 | 0.024 |
| 2014-08-19 | 0.024 |
| 2014-08-20 | 0.024 |
| 2014-08-21 | 0.024 |
| 2014-08-22 | 0.024 |
| 2014-08-25 | 0.024 |
| 2014-08-26 | 0.024 |
| 2014-08-27 | 0.024 |
| 2014-08-28 | 0.023 |
| 2014-08-29 | 0.024 |
| 2014-09-01 | 0.024 |
| 2014-09-02 | 0.024 |
| 2014-09-03 | 0.024 |
| 2014-09-04 | 0.024 |
| 2014-09-05 | 0.025 |
| 2014-09-08 | 0.025 |
| 2014-09-09 | 0.025 |
| 2014-09-10 | 0.025 |
| 2014-09-11 | 0.025 |
| 2014-09-12 | 0.026 |
| 2014-09-15 | 0.026 |
| 2014-09-16 | 0.026 |
| 2014-09-17 | 0.026 |
| 2014-09-18 | 0.026 |
| 2014-09-19 | 0.026 |
| 2014-09-22 | 0.026 |
| 2014-09-23 | 0.025 |
| 2014-09-24 | 0.026 |
| 2014-09-25 | 0.025 |
| 2014-09-26 | 0.025 |
| 2014-09-29 | 0.025 |
| 2014-09-30 | 0.025 |
| 2014-10-01 | 0.024 |
| 2014-10-02 | 0.024 |
| 2014-10-03 | 0.024 |
| 2014-10-06 | 0.024 |
| 2014-10-07 | 0.024 |
| 2014-10-08 | 0.024 |
| 2014-10-09 | 0.023 |
| 2014-10-10 | 0.023 |
| 2014-10-13 | 0.023 |
| 2014-10-14 | 0.022 |
| 2014-10-15 | 0.022 |
| 2014-10-16 | 0.022 |
| 2014-10-17 | 0.022 |
| 2014-10-20 | 0.022 |
| 2014-10-21 | 0.022 |
| 2014-10-22 | 0.022 |
| 2014-10-23 | 0.023 |
| 2014-10-24 | 0.023 |
| 2014-10-27 | 0.023 |
| 2014-10-28 | 0.023 |
| 2014-10-29 | 0.023 |
| 2014-10-30 | 0.023 |
| 2014-10-31 | 0.024 |
| 2014-11-03 | 0.024 |
| 2014-11-04 | 0.024 |
| 2014-11-05 | 0.024 |
| 2014-11-06 | 0.024 |
| 2014-11-07 | 0.023 |
| 2014-11-10 | 0.024 |
| 2014-11-11 | 0.024 |
| 2014-11-12 | 0.024 |
| 2014-11-13 | 0.024 |
| 2014-11-14 | 0.023 |
| 2014-11-17 | 0.023 |
| 2014-11-18 | 0.023 |
| 2014-11-19 | 0.024 |
| 2014-11-20 | 0.023 |
| 2014-11-21 | 0.023 |
| 2014-11-24 | 0.023 |
| 2014-11-25 | 0.023 |
| 2014-11-26 | 0.022 |
| 2014-11-27 | 0.022 |
| 2014-11-28 | 0.022 |
| 2014-12-01 | 0.022 |
| 2014-12-02 | 0.023 |
| 2014-12-03 | 0.023 |
| 2014-12-04 | 0.022 |
| 2014-12-05 | 0.023 |
| 2014-12-08 | 0.023 |
| 2014-12-09 | 0.022 |
| 2014-12-10 | 0.022 |
| 2014-12-11 | 0.022 |
| 2014-12-12 | 0.021 |
| 2014-12-15 | 0.021 |
| 2014-12-16 | 0.021 |
| 2014-12-17 | 0.021 |
| 2014-12-18 | 0.022 |
| 2014-12-19 | 0.022 |
| 2014-12-22 | 0.022 |
| 2014-12-23 | 0.023 |
| 2014-12-24 | 0.023 |
| 2014-12-25 | 0.023 |
| 2014-12-26 | 0.022 |
| 2014-12-29 | 0.022 |
| 2014-12-30 | 0.022 |
| 2014-12-31 | 0.022 |
| 2015-01-01 | 0.022 |
| 2015-01-02 | 0.021 |
| 2015-01-05 | 0.02 |
| 2015-01-06 | 0.02 |
| 2015-01-07 | 0.02 |
| 2015-01-08 | 0.02 |
| 2015-01-09 | 0.02 |
| 2015-01-12 | 0.019 |
| 2015-01-13 | 0.019 |
| 2015-01-14 | 0.019 |
| 2015-01-15 | 0.018 |
| 2015-01-16 | 0.018 |
| 2015-01-19 | 0.018 |
| 2015-01-20 | 0.018 |
| 2015-01-21 | 0.019 |
| 2015-01-22 | 0.019 |
| 2015-01-23 | 0.018 |
| 2015-01-26 | 0.018 |
| 2015-01-27 | 0.018 |
| 2015-01-28 | 0.017 |
| 2015-01-29 | 0.018 |
| 2015-01-30 | 0.017 |
| 2015-02-02 | 0.017 |
| 2015-02-03 | 0.018 |
| 2015-02-04 | 0.018 |
| 2015-02-05 | 0.018 |
| 2015-02-06 | 0.02 |
| 2015-02-09 | 0.02 |
| 2015-02-10 | 0.02 |
| 2015-02-11 | 0.02 |
| 2015-02-12 | 0.02 |
| 2015-02-13 | 0.02 |
| 2015-02-16 | 0.02 |
| 2015-02-17 | 0.021 |
| 2015-02-18 | 0.021 |
| 2015-02-19 | 0.021 |
| 2015-02-20 | 0.021 |
| 2015-02-23 | 0.021 |
| 2015-02-24 | 0.02 |
| 2015-02-25 | 0.02 |
| 2015-02-26 | 0.02 |
| 2015-02-27 | 0.02 |
| 2015-03-02 | 0.021 |
| 2015-03-03 | 0.021 |
| 2015-03-04 | 0.021 |
| 2015-03-05 | 0.021 |
| 2015-03-06 | 0.022 |
| 2015-03-09 | 0.022 |
| 2015-03-10 | 0.021 |
| 2015-03-11 | 0.021 |
| 2015-03-12 | 0.021 |
| 2015-03-13 | 0.021 |
| 2015-03-16 | 0.021 |
| 2015-03-17 | 0.021 |
| 2015-03-18 | 0.019 |
| 2015-03-19 | 0.02 |
| 2015-03-20 | 0.019 |
| 2015-03-23 | 0.019 |
| 2015-03-24 | 0.019 |
| 2015-03-25 | 0.019 |
| 2015-03-26 | 0.02 |
| 2015-03-27 | 0.02 |
| 2015-03-30 | 0.02 |
| 2015-03-31 | 0.019 |
| 2015-04-01 | 0.019 |
| 2015-04-02 | 0.019 |
| 2015-04-03 | 0.019 |
| 2015-04-06 | 0.019 |
| 2015-04-07 | 0.019 |
| 2015-04-08 | 0.019 |
| 2015-04-09 | 0.02 |
| 2015-04-10 | 0.02 |
| 2015-04-13 | 0.019 |
| 2015-04-14 | 0.019 |
| 2015-04-15 | 0.019 |
| 2015-04-16 | 0.019 |
| 2015-04-17 | 0.019 |
| 2015-04-20 | 0.019 |
| 2015-04-21 | 0.019 |
| 2015-04-22 | 0.02 |
| 2015-04-23 | 0.02 |
| 2015-04-24 | 0.019 |
| 2015-04-27 | 0.019 |
| 2015-04-28 | 0.02 |
| 2015-04-29 | 0.021 |
| 2015-04-30 | 0.02 |
| 2015-05-01 | 0.021 |
| 2015-05-04 | 0.022 |
| 2015-05-05 | 0.022 |
| 2015-05-06 | 0.022 |
| 2015-05-07 | 0.022 |
| 2015-05-08 | 0.022 |
| 2015-05-11 | 0.023 |
| 2015-05-12 | 0.023 |
| 2015-05-13 | 0.023 |
| 2015-05-14 | 0.022 |
| 2015-05-15 | 0.021 |
| 2015-05-18 | 0.022 |
| 2015-05-19 | 0.023 |
| 2015-05-20 | 0.023 |
| 2015-05-21 | 0.022 |
| 2015-05-22 | 0.022 |
| 2015-05-25 | 0.022 |
| 2015-05-26 | 0.021 |
| 2015-05-27 | 0.021 |
| 2015-05-28 | 0.021 |
| 2015-05-29 | 0.021 |
| 2015-06-01 | 0.022 |
| 2015-06-02 | 0.023 |
| 2015-06-03 | 0.024 |
| 2015-06-04 | 0.023 |
| 2015-06-05 | 0.024 |
| 2015-06-08 | 0.024 |
| 2015-06-09 | 0.024 |
| 2015-06-10 | 0.025 |
| 2015-06-11 | 0.024 |
| 2015-06-12 | 0.024 |
| 2015-06-15 | 0.024 |
| 2015-06-16 | 0.023 |
| 2015-06-17 | 0.023 |
| 2015-06-18 | 0.024 |
| 2015-06-19 | 0.023 |
| 2015-06-22 | 0.024 |
| 2015-06-23 | 0.024 |
| 2015-06-24 | 0.024 |
| 2015-06-25 | 0.024 |
| 2015-06-26 | 0.025 |
| 2015-06-29 | 0.023 |
| 2015-06-30 | 0.024 |
| 2015-07-01 | 0.024 |
| 2015-07-02 | 0.024 |
| 2015-07-03 | 0.024 |
| 2015-07-06 | 0.023 |
| 2015-07-07 | 0.023 |
| 2015-07-08 | 0.022 |
| 2015-07-09 | 0.023 |
| 2015-07-10 | 0.024 |
| 2015-07-13 | 0.024 |
| 2015-07-14 | 0.024 |
| 2015-07-15 | 0.024 |
| 2015-07-16 | 0.024 |
| 2015-07-17 | 0.023 |
| 2015-07-20 | 0.024 |
| 2015-07-21 | 0.024 |
| 2015-07-22 | 0.023 |
| 2015-07-23 | 0.023 |
| 2015-07-24 | 0.023 |
| 2015-07-27 | 0.022 |
| 2015-07-28 | 0.023 |
| 2015-07-29 | 0.023 |
| 2015-07-30 | 0.023 |
| 2015-07-31 | 0.022 |
| 2015-08-03 | 0.022 |
| 2015-08-04 | 0.022 |
| 2015-08-05 | 0.023 |
| 2015-08-06 | 0.022 |
| 2015-08-07 | 0.022 |
| 2015-08-10 | 0.022 |
| 2015-08-11 | 0.022 |
| 2015-08-12 | 0.021 |
| 2015-08-13 | 0.022 |
| 2015-08-14 | 0.022 |
| 2015-08-17 | 0.022 |
| 2015-08-18 | 0.022 |
| 2015-08-19 | 0.021 |
| 2015-08-20 | 0.021 |
| 2015-08-21 | 0.02 |
| 2015-08-24 | 0.02 |
| 2015-08-25 | 0.021 |
| 2015-08-26 | 0.022 |
| 2015-08-27 | 0.022 |
| 2015-08-28 | 0.022 |
| 2015-08-31 | 0.022 |
| 2015-09-01 | 0.022 |
| 2015-09-02 | 0.022 |
| 2015-09-03 | 0.022 |
| 2015-09-04 | 0.021 |
| 2015-09-07 | 0.021 |
| 2015-09-08 | 0.022 |
| 2015-09-09 | 0.022 |
| 2015-09-10 | 0.022 |
| 2015-09-11 | 0.022 |
| 2015-09-14 | 0.022 |
| 2015-09-15 | 0.023 |
| 2015-09-16 | 0.023 |
| 2015-09-17 | 0.022 |
| 2015-09-18 | 0.021 |
| 2015-09-21 | 0.022 |
| 2015-09-22 | 0.021 |
| 2015-09-23 | 0.022 |
| 2015-09-24 | 0.021 |
| 2015-09-25 | 0.022 |
| 2015-09-28 | 0.021 |
| 2015-09-29 | 0.02 |
| 2015-09-30 | 0.021 |
| 2015-10-01 | 0.02 |
| 2015-10-02 | 0.02 |
| 2015-10-05 | 0.021 |
| 2015-10-06 | 0.02 |
| 2015-10-07 | 0.021 |
| 2015-10-08 | 0.021 |
| 2015-10-09 | 0.021 |
| 2015-10-12 | 0.021 |
| 2015-10-13 | 0.021 |
| 2015-10-14 | 0.02 |
| 2015-10-15 | 0.02 |
| 2015-10-16 | 0.02 |
| 2015-10-19 | 0.02 |
| 2015-10-20 | 0.021 |
| 2015-10-21 | 0.02 |
| 2015-10-22 | 0.02 |
| 2015-10-23 | 0.021 |
| 2015-10-26 | 0.021 |
| 2015-10-27 | 0.02 |
| 2015-10-28 | 0.021 |
| 2015-10-29 | 0.022 |
| 2015-10-30 | 0.022 |
| 2015-11-02 | 0.022 |
| 2015-11-03 | 0.022 |
| 2015-11-04 | 0.022 |
| 2015-11-05 | 0.023 |
| 2015-11-06 | 0.023 |
| 2015-11-09 | 0.024 |
| 2015-11-10 | 0.023 |
| 2015-11-11 | 0.023 |
| 2015-11-12 | 0.023 |
| 2015-11-13 | 0.023 |
| 2015-11-16 | 0.023 |
| 2015-11-17 | 0.022 |
| 2015-11-18 | 0.023 |
| 2015-11-19 | 0.022 |
| 2015-11-20 | 0.023 |
| 2015-11-23 | 0.022 |
| 2015-11-24 | 0.022 |
| 2015-11-25 | 0.022 |
| 2015-11-26 | 0.022 |
| 2015-11-27 | 0.022 |
| 2015-11-30 | 0.022 |
| 2015-12-01 | 0.022 |
| 2015-12-02 | 0.022 |
| 2015-12-03 | 0.023 |
| 2015-12-04 | 0.023 |
| 2015-12-07 | 0.022 |
| 2015-12-08 | 0.022 |
| 2015-12-09 | 0.022 |
| 2015-12-10 | 0.022 |
| 2015-12-11 | 0.021 |
| 2015-12-14 | 0.022 |
| 2015-12-15 | 0.023 |
| 2015-12-16 | 0.023 |
| 2015-12-17 | 0.022 |
| 2015-12-18 | 0.022 |
| 2015-12-21 | 0.022 |
| 2015-12-22 | 0.022 |
| 2015-12-23 | 0.023 |
| 2015-12-24 | 0.022 |
| 2015-12-25 | 0.022 |
| 2015-12-28 | 0.022 |
| 2015-12-29 | 0.023 |
| 2015-12-30 | 0.023 |
| 2015-12-31 | 0.023 |
| 2016-01-01 | 0.023 |
| 2016-01-04 | 0.022 |
| 2016-01-05 | 0.022 |
| 2016-01-06 | 0.022 |
| 2016-01-07 | 0.022 |
| 2016-01-08 | 0.021 |
| 2016-01-11 | 0.022 |
| 2016-01-12 | 0.021 |
| 2016-01-13 | 0.021 |
| 2016-01-14 | 0.021 |
| 2016-01-15 | 0.02 |
| 2016-01-18 | 0.02 |
| 2016-01-19 | 0.021 |
| 2016-01-20 | 0.02 |
| 2016-01-21 | 0.02 |
| 2016-01-22 | 0.021 |
| 2016-01-25 | 0.02 |
| 2016-01-26 | 0.02 |
| 2016-01-27 | 0.02 |
| 2016-01-28 | 0.02 |
| 2016-01-29 | 0.019 |
| 2016-02-01 | 0.02 |
| 2016-02-02 | 0.019 |
| 2016-02-03 | 0.019 |
| 2016-02-04 | 0.019 |
| 2016-02-05 | 0.019 |
| 2016-02-08 | 0.018 |
| 2016-02-09 | 0.017 |
| 2016-02-10 | 0.017 |
| 2016-02-11 | 0.016 |
| 2016-02-12 | 0.017 |
| 2016-02-15 | 0.017 |
| 2016-02-16 | 0.018 |
| 2016-02-17 | 0.018 |
| 2016-02-18 | 0.018 |
| 2016-02-19 | 0.018 |
| 2016-02-22 | 0.018 |
| 2016-02-23 | 0.017 |
| 2016-02-24 | 0.018 |
| 2016-02-25 | 0.017 |
| 2016-02-26 | 0.018 |
| 2016-02-29 | 0.017 |
| 2016-03-01 | 0.018 |
| 2016-03-02 | 0.018 |
| 2016-03-03 | 0.018 |
| 2016-03-04 | 0.019 |
| 2016-03-07 | 0.019 |
| 2016-03-08 | 0.018 |
| 2016-03-09 | 0.019 |
| 2016-03-10 | 0.019 |
| 2016-03-11 | 0.02 |
| 2016-03-14 | 0.02 |
| 2016-03-15 | 0.02 |
| 2016-03-16 | 0.019 |
| 2016-03-17 | 0.019 |
| 2016-03-18 | 0.019 |
| 2016-03-21 | 0.019 |
| 2016-03-22 | 0.019 |
| 2016-03-23 | 0.019 |
| 2016-03-24 | 0.019 |
| 2016-03-25 | 0.019 |
| 2016-03-28 | 0.019 |
| 2016-03-29 | 0.018 |
| 2016-03-30 | 0.018 |
| 2016-03-31 | 0.018 |
| 2016-04-01 | 0.018 |
| 2016-04-04 | 0.018 |
| 2016-04-05 | 0.017 |
| 2016-04-06 | 0.018 |
| 2016-04-07 | 0.017 |
| 2016-04-08 | 0.017 |
| 2016-04-11 | 0.017 |
| 2016-04-12 | 0.018 |
| 2016-04-13 | 0.018 |
| 2016-04-14 | 0.018 |
| 2016-04-15 | 0.018 |
| 2016-04-18 | 0.018 |
| 2016-04-19 | 0.018 |
| 2016-04-20 | 0.019 |
| 2016-04-21 | 0.019 |
| 2016-04-22 | 0.019 |
| 2016-04-25 | 0.019 |
| 2016-04-26 | 0.019 |
| 2016-04-27 | 0.019 |
| 2016-04-28 | 0.018 |
| 2016-04-29 | 0.018 |
| 2016-05-02 | 0.019 |
| 2016-05-03 | 0.018 |
| 2016-05-04 | 0.018 |
| 2016-05-05 | 0.018 |
| 2016-05-06 | 0.018 |
| 2016-05-09 | 0.018 |
| 2016-05-10 | 0.018 |
| 2016-05-11 | 0.017 |
| 2016-05-12 | 0.018 |
| 2016-05-13 | 0.017 |
| 2016-05-16 | 0.018 |
| 2016-05-17 | 0.018 |
| 2016-05-18 | 0.019 |
| 2016-05-19 | 0.019 |
| 2016-05-20 | 0.019 |
| 2016-05-23 | 0.018 |
| 2016-05-24 | 0.019 |
| 2016-05-25 | 0.019 |
| 2016-05-26 | 0.018 |
| 2016-05-27 | 0.019 |
| 2016-05-30 | 0.019 |
| 2016-05-31 | 0.018 |
| 2016-06-01 | 0.019 |
| 2016-06-02 | 0.018 |
| 2016-06-03 | 0.017 |
| 2016-06-06 | 0.017 |
| 2016-06-07 | 0.017 |
| 2016-06-08 | 0.017 |
| 2016-06-09 | 0.017 |
| 2016-06-10 | 0.016 |
| 2016-06-13 | 0.016 |
| 2016-06-14 | 0.016 |
| 2016-06-15 | 0.016 |
| 2016-06-16 | 0.016 |
| 2016-06-17 | 0.016 |
| 2016-06-20 | 0.017 |
| 2016-06-21 | 0.017 |
| 2016-06-22 | 0.017 |
| 2016-06-23 | 0.017 |
| 2016-06-24 | 0.016 |
| 2016-06-27 | 0.015 |
| 2016-06-28 | 0.015 |
| 2016-06-29 | 0.015 |
| 2016-06-30 | 0.015 |
| 2016-07-01 | 0.015 |
| 2016-07-04 | 0.015 |
| 2016-07-05 | 0.014 |
| 2016-07-06 | 0.014 |
| 2016-07-07 | 0.014 |
| 2016-07-08 | 0.014 |
| 2016-07-11 | 0.014 |
| 2016-07-12 | 0.015 |
| 2016-07-13 | 0.015 |
| 2016-07-14 | 0.015 |
| 2016-07-15 | 0.016 |
| 2016-07-18 | 0.016 |
| 2016-07-19 | 0.016 |
| 2016-07-20 | 0.016 |
| 2016-07-21 | 0.016 |
| 2016-07-22 | 0.016 |
| 2016-07-25 | 0.016 |
| 2016-07-26 | 0.016 |
| 2016-07-27 | 0.015 |
| 2016-07-28 | 0.015 |
| 2016-07-29 | 0.015 |
| 2016-08-01 | 0.015 |
| 2016-08-02 | 0.016 |
| 2016-08-03 | 0.016 |
| 2016-08-04 | 0.015 |
| 2016-08-05 | 0.016 |
| 2016-08-08 | 0.016 |
| 2016-08-09 | 0.016 |
| 2016-08-10 | 0.015 |
| 2016-08-11 | 0.016 |
| 2016-08-12 | 0.015 |
| 2016-08-15 | 0.016 |
| 2016-08-16 | 0.016 |
| 2016-08-17 | 0.016 |
| 2016-08-18 | 0.015 |
| 2016-08-19 | 0.016 |
| 2016-08-22 | 0.016 |
| 2016-08-23 | 0.016 |
| 2016-08-24 | 0.016 |
| 2016-08-25 | 0.016 |
| 2016-08-26 | 0.016 |
| 2016-08-29 | 0.016 |
| 2016-08-30 | 0.016 |
| 2016-08-31 | 0.016 |
| 2016-09-01 | 0.016 |
| 2016-09-02 | 0.016 |
| 2016-09-05 | 0.016 |
| 2016-09-06 | 0.016 |
| 2016-09-07 | 0.015 |
| 2016-09-08 | 0.016 |
| 2016-09-09 | 0.017 |
| 2016-09-12 | 0.017 |
| 2016-09-13 | 0.017 |
| 2016-09-14 | 0.017 |
| 2016-09-15 | 0.017 |
| 2016-09-16 | 0.017 |
| 2016-09-19 | 0.017 |
| 2016-09-20 | 0.017 |
| 2016-09-21 | 0.017 |
| 2016-09-22 | 0.016 |
| 2016-09-23 | 0.016 |
| 2016-09-26 | 0.016 |
| 2016-09-27 | 0.016 |
| 2016-09-28 | 0.016 |
| 2016-09-29 | 0.016 |
| 2016-09-30 | 0.016 |
| 2016-10-03 | 0.016 |
| 2016-10-04 | 0.017 |
| 2016-10-05 | 0.017 |
| 2016-10-06 | 0.018 |
| 2016-10-07 | 0.017 |
| 2016-10-10 | 0.017 |
| 2016-10-11 | 0.018 |
| 2016-10-12 | 0.018 |
| 2016-10-13 | 0.018 |
| 2016-10-14 | 0.018 |
| 2016-10-17 | 0.018 |
| 2016-10-18 | 0.018 |
| 2016-10-19 | 0.018 |
| 2016-10-20 | 0.018 |
| 2016-10-21 | 0.017 |
| 2016-10-24 | 0.018 |
| 2016-10-25 | 0.018 |
| 2016-10-26 | 0.018 |
| 2016-10-27 | 0.019 |
| 2016-10-28 | 0.019 |
| 2016-10-31 | 0.018 |
| 2016-11-01 | 0.018 |
| 2016-11-02 | 0.018 |
| 2016-11-03 | 0.018 |
| 2016-11-04 | 0.018 |
| 2016-11-07 | 0.018 |
| 2016-11-08 | 0.019 |
| 2016-11-09 | 0.021 |
| 2016-11-10 | 0.022 |
| 2016-11-11 | 0.022 |
| 2016-11-14 | 0.022 |
| 2016-11-15 | 0.022 |
| 2016-11-16 | 0.022 |
| 2016-11-17 | 0.023 |
| 2016-11-18 | 0.023 |
| 2016-11-21 | 0.023 |
| 2016-11-22 | 0.023 |
| 2016-11-23 | 0.024 |
| 2016-11-24 | 0.024 |
| 2016-11-25 | 0.024 |
| 2016-11-28 | 0.023 |
| 2016-11-29 | 0.023 |
| 2016-11-30 | 0.024 |
| 2016-12-01 | 0.024 |
| 2016-12-02 | 0.024 |
| 2016-12-05 | 0.024 |
| 2016-12-06 | 0.024 |
| 2016-12-07 | 0.023 |
| 2016-12-08 | 0.024 |
| 2016-12-09 | 0.025 |
| 2016-12-12 | 0.025 |
| 2016-12-13 | 0.025 |
| 2016-12-14 | 0.025 |
| 2016-12-15 | 0.026 |
| 2016-12-16 | 0.026 |
| 2016-12-19 | 0.025 |
| 2016-12-20 | 0.026 |
| 2016-12-21 | 0.026 |
| 2016-12-22 | 0.026 |
| 2016-12-23 | 0.026 |
| 2016-12-26 | 0.026 |
| 2016-12-27 | 0.026 |
| 2016-12-28 | 0.025 |
| 2016-12-29 | 0.025 |
| 2016-12-30 | 0.024 |
| 2017-01-02 | 0.024 |
| 2017-01-03 | 0.024 |
| 2017-01-04 | 0.025 |
| 2017-01-05 | 0.024 |
| 2017-01-06 | 0.024 |
| 2017-01-09 | 0.024 |
| 2017-01-10 | 0.024 |
| 2017-01-11 | 0.024 |
| 2017-01-12 | 0.024 |
| 2017-01-13 | 0.024 |
| 2017-01-16 | 0.024 |
| 2017-01-17 | 0.023 |
| 2017-01-18 | 0.024 |
| 2017-01-19 | 0.025 |
| 2017-01-20 | 0.025 |
| 2017-01-23 | 0.024 |
| 2017-01-24 | 0.025 |
| 2017-01-25 | 0.025 |
| 2017-01-26 | 0.025 |
| 2017-01-27 | 0.025 |
| 2017-01-30 | 0.025 |
| 2017-01-31 | 0.024 |
| 2017-02-01 | 0.025 |
| 2017-02-02 | 0.025 |
| 2017-02-03 | 0.025 |
| 2017-02-06 | 0.024 |
| 2017-02-07 | 0.024 |
| 2017-02-08 | 0.023 |
| 2017-02-09 | 0.024 |
| 2017-02-10 | 0.024 |
| 2017-02-13 | 0.024 |
| 2017-02-14 | 0.025 |
| 2017-02-15 | 0.025 |
| 2017-02-16 | 0.024 |
| 2017-02-17 | 0.024 |
| 2017-02-20 | 0.024 |
| 2017-02-21 | 0.024 |
| 2017-02-22 | 0.024 |
| 2017-02-23 | 0.024 |
| 2017-02-24 | 0.023 |
| 2017-02-27 | 0.024 |
| 2017-02-28 | 0.024 |
| 2017-03-01 | 0.025 |
| 2017-03-02 | 0.025 |
| 2017-03-03 | 0.025 |
| 2017-03-06 | 0.025 |
| 2017-03-07 | 0.025 |
| 2017-03-08 | 0.026 |
| 2017-03-09 | 0.026 |
| 2017-03-10 | 0.026 |
| 2017-03-13 | 0.026 |
| 2017-03-14 | 0.026 |
| 2017-03-15 | 0.025 |
| 2017-03-16 | 0.025 |
| 2017-03-17 | 0.025 |
| 2017-03-20 | 0.025 |
| 2017-03-21 | 0.024 |
| 2017-03-22 | 0.024 |
| 2017-03-23 | 0.024 |
| 2017-03-24 | 0.024 |
| 2017-03-27 | 0.024 |
| 2017-03-28 | 0.024 |
| 2017-03-29 | 0.024 |
| 2017-03-30 | 0.024 |
| 2017-03-31 | 0.024 |
| 2017-04-03 | 0.024 |
| 2017-04-04 | 0.024 |
| 2017-04-05 | 0.023 |
| 2017-04-06 | 0.023 |
| 2017-04-07 | 0.024 |
| 2017-04-10 | 0.024 |
| 2017-04-11 | 0.023 |
| 2017-04-12 | 0.023 |
| 2017-04-13 | 0.022 |
| 2017-04-14 | 0.022 |
| 2017-04-17 | 0.023 |
| 2017-04-18 | 0.022 |
| 2017-04-19 | 0.022 |
| 2017-04-20 | 0.022 |
| 2017-04-21 | 0.022 |
| 2017-04-24 | 0.023 |
| 2017-04-25 | 0.024 |
| 2017-04-26 | 0.023 |
| 2017-04-27 | 0.023 |
| 2017-04-28 | 0.023 |
| 2017-05-01 | 0.023 |
| 2017-05-02 | 0.023 |
| 2017-05-03 | 0.023 |
| 2017-05-04 | 0.024 |
| 2017-05-05 | 0.024 |
| 2017-05-08 | 0.024 |
| 2017-05-09 | 0.024 |
| 2017-05-10 | 0.024 |
| 2017-05-11 | 0.024 |
| 2017-05-12 | 0.023 |
| 2017-05-15 | 0.023 |
| 2017-05-16 | 0.023 |
| 2017-05-17 | 0.022 |
| 2017-05-18 | 0.022 |
| 2017-05-19 | 0.022 |
| 2017-05-22 | 0.022 |
| 2017-05-23 | 0.023 |
| 2017-05-24 | 0.023 |
| 2017-05-25 | 0.022 |
| 2017-05-26 | 0.022 |
| 2017-05-29 | 0.022 |
| 2017-05-30 | 0.022 |
| 2017-05-31 | 0.022 |
| 2017-06-01 | 0.022 |
| 2017-06-02 | 0.022 |
| 2017-06-05 | 0.022 |
| 2017-06-06 | 0.021 |
| 2017-06-07 | 0.022 |
| 2017-06-08 | 0.022 |
| 2017-06-09 | 0.022 |
| 2017-06-12 | 0.022 |
| 2017-06-13 | 0.022 |
| 2017-06-14 | 0.022 |
| 2017-06-15 | 0.022 |
| 2017-06-16 | 0.022 |
| 2017-06-19 | 0.022 |
| 2017-06-20 | 0.022 |
| 2017-06-21 | 0.022 |
| 2017-06-22 | 0.022 |
| 2017-06-23 | 0.022 |
| 2017-06-26 | 0.021 |
| 2017-06-27 | 0.022 |
| 2017-06-28 | 0.022 |
| 2017-06-29 | 0.023 |
| 2017-06-30 | 0.023 |
| 2017-07-03 | 0.024 |
| 2017-07-04 | 0.024 |
| 2017-07-05 | 0.023 |
| 2017-07-06 | 0.024 |
| 2017-07-07 | 0.024 |
| 2017-07-10 | 0.024 |
| 2017-07-11 | 0.024 |
| 2017-07-12 | 0.023 |
| 2017-07-13 | 0.024 |
| 2017-07-14 | 0.023 |
| 2017-07-17 | 0.023 |
| 2017-07-18 | 0.023 |
| 2017-07-19 | 0.023 |
| 2017-07-20 | 0.023 |
| 2017-07-21 | 0.022 |
| 2017-07-24 | 0.023 |
| 2017-07-25 | 0.023 |
| 2017-07-26 | 0.023 |
| 2017-07-27 | 0.023 |
| 2017-07-28 | 0.023 |
| 2017-07-31 | 0.023 |
| 2017-08-01 | 0.023 |
| 2017-08-02 | 0.023 |
| 2017-08-03 | 0.022 |
| 2017-08-04 | 0.023 |
| 2017-08-07 | 0.023 |
| 2017-08-08 | 0.023 |
| 2017-08-09 | 0.022 |
| 2017-08-10 | 0.022 |
| 2017-08-11 | 0.022 |
| 2017-08-14 | 0.022 |
| 2017-08-15 | 0.023 |
| 2017-08-16 | 0.022 |
| 2017-08-17 | 0.022 |
| 2017-08-18 | 0.022 |
| 2017-08-21 | 0.022 |
| 2017-08-22 | 0.022 |
| 2017-08-23 | 0.022 |
| 2017-08-24 | 0.022 |
| 2017-08-25 | 0.022 |
| 2017-08-28 | 0.022 |
| 2017-08-29 | 0.021 |
| 2017-08-30 | 0.022 |
| 2017-08-31 | 0.021 |
| 2017-09-01 | 0.022 |
| 2017-09-04 | 0.022 |
| 2017-09-05 | 0.021 |
| 2017-09-06 | 0.021 |
| 2017-09-07 | 0.02 |
| 2017-09-08 | 0.021 |
| 2017-09-11 | 0.021 |
| 2017-09-12 | 0.022 |
| 2017-09-13 | 0.022 |
| 2017-09-14 | 0.022 |
| 2017-09-15 | 0.022 |
| 2017-09-18 | 0.022 |
| 2017-09-19 | 0.022 |
| 2017-09-20 | 0.023 |
| 2017-09-21 | 0.023 |
| 2017-09-22 | 0.023 |
| 2017-09-25 | 0.022 |
| 2017-09-26 | 0.022 |
| 2017-09-27 | 0.023 |
| 2017-09-28 | 0.023 |
| 2017-09-29 | 0.023 |
| 2017-10-02 | 0.023 |
| 2017-10-03 | 0.023 |
| 2017-10-04 | 0.023 |
| 2017-10-05 | 0.024 |
| 2017-10-06 | 0.024 |
| 2017-10-09 | 0.024 |
| 2017-10-10 | 0.024 |
| 2017-10-11 | 0.024 |
| 2017-10-12 | 0.023 |
| 2017-10-13 | 0.023 |
| 2017-10-16 | 0.023 |
| 2017-10-17 | 0.023 |
| 2017-10-18 | 0.023 |
| 2017-10-19 | 0.023 |
| 2017-10-20 | 0.024 |
| 2017-10-23 | 0.024 |
| 2017-10-24 | 0.024 |
| 2017-10-25 | 0.024 |
| 2017-10-26 | 0.025 |
| 2017-10-27 | 0.024 |
| 2017-10-30 | 0.024 |
| 2017-10-31 | 0.024 |
| 2017-11-01 | 0.024 |
| 2017-11-02 | 0.024 |
| 2017-11-03 | 0.023 |
| 2017-11-06 | 0.023 |
| 2017-11-07 | 0.023 |
| 2017-11-08 | 0.023 |
| 2017-11-09 | 0.023 |
| 2017-11-10 | 0.024 |
| 2017-11-13 | 0.024 |
| 2017-11-14 | 0.024 |
| 2017-11-15 | 0.023 |
| 2017-11-16 | 0.024 |
| 2017-11-17 | 0.024 |
| 2017-11-20 | 0.024 |
| 2017-11-21 | 0.024 |
| 2017-11-22 | 0.023 |
| 2017-11-23 | 0.023 |
| 2017-11-24 | 0.023 |
| 2017-11-27 | 0.023 |
| 2017-11-28 | 0.023 |
| 2017-11-29 | 0.024 |
| 2017-11-30 | 0.024 |
| 2017-12-01 | 0.024 |
| 2017-12-04 | 0.024 |
| 2017-12-05 | 0.024 |
| 2017-12-06 | 0.023 |
| 2017-12-07 | 0.024 |
| 2017-12-08 | 0.024 |
| 2017-12-11 | 0.024 |
| 2017-12-12 | 0.024 |
| 2017-12-13 | 0.024 |
| 2017-12-14 | 0.024 |
| 2017-12-15 | 0.024 |
| 2017-12-18 | 0.024 |
| 2017-12-19 | 0.025 |
| 2017-12-20 | 0.025 |
| 2017-12-21 | 0.025 |
| 2017-12-22 | 0.025 |
| 2017-12-25 | 0.025 |
| 2017-12-26 | 0.025 |
| 2017-12-27 | 0.024 |
| 2017-12-28 | 0.024 |
| 2017-12-29 | 0.024 |
| 2018-01-01 | 0.024 |
| 2018-01-02 | 0.025 |
| 2018-01-03 | 0.024 |
| 2018-01-04 | 0.025 |
| 2018-01-05 | 0.025 |
| 2018-01-08 | 0.025 |
| 2018-01-09 | 0.026 |
| 2018-01-10 | 0.026 |
| 2018-01-11 | 0.025 |
| 2018-01-12 | 0.026 |
| 2018-01-15 | 0.026 |
| 2018-01-16 | 0.025 |
| 2018-01-17 | 0.026 |
| 2018-01-18 | 0.026 |
| 2018-01-19 | 0.026 |
| 2018-01-22 | 0.027 |
| 2018-01-23 | 0.026 |
| 2018-01-24 | 0.026 |
| 2018-01-25 | 0.026 |
| 2018-01-26 | 0.027 |
| 2018-01-29 | 0.027 |
| 2018-01-30 | 0.027 |
| 2018-01-31 | 0.027 |
| 2018-02-01 | 0.028 |
| 2018-02-02 | 0.028 |
| 2018-02-05 | 0.028 |
| 2018-02-06 | 0.028 |
| 2018-02-07 | 0.028 |
| 2018-02-08 | 0.028 |
| 2018-02-09 | 0.028 |
| 2018-02-12 | 0.029 |
| 2018-02-13 | 0.028 |
| 2018-02-14 | 0.029 |
| 2018-02-15 | 0.029 |
| 2018-02-16 | 0.029 |
| 2018-02-19 | 0.029 |
| 2018-02-20 | 0.029 |
| 2018-02-21 | 0.029 |
| 2018-02-22 | 0.029 |
| 2018-02-23 | 0.029 |
| 2018-02-26 | 0.029 |
| 2018-02-27 | 0.029 |
| 2018-02-28 | 0.029 |
| 2018-03-01 | 0.028 |
| 2018-03-02 | 0.029 |
| 2018-03-05 | 0.029 |
| 2018-03-06 | 0.029 |
| 2018-03-07 | 0.029 |
| 2018-03-08 | 0.029 |
| 2018-03-09 | 0.029 |
| 2018-03-12 | 0.029 |
| 2018-03-13 | 0.028 |
| 2018-03-14 | 0.028 |
| 2018-03-15 | 0.028 |
| 2018-03-16 | 0.028 |
| 2018-03-19 | 0.028 |
| 2018-03-20 | 0.029 |
| 2018-03-21 | 0.029 |
| 2018-03-22 | 0.028 |
| 2018-03-23 | 0.028 |
| 2018-03-26 | 0.028 |
| 2018-03-27 | 0.028 |
| 2018-03-28 | 0.028 |
| 2018-03-29 | 0.027 |
| 2018-03-30 | 0.027 |
| 2018-04-02 | 0.027 |
| 2018-04-03 | 0.028 |
| 2018-04-04 | 0.028 |
| 2018-04-05 | 0.028 |
| 2018-04-06 | 0.028 |
| 2018-04-09 | 0.028 |
| 2018-04-10 | 0.028 |
| 2018-04-11 | 0.028 |
| 2018-04-12 | 0.028 |
| 2018-04-13 | 0.028 |
| 2018-04-16 | 0.028 |
| 2018-04-17 | 0.028 |
| 2018-04-18 | 0.029 |
| 2018-04-19 | 0.029 |
| 2018-04-20 | 0.03 |
| 2018-04-23 | 0.03 |
| 2018-04-24 | 0.03 |
| 2018-04-25 | 0.03 |
| 2018-04-26 | 0.03 |
| 2018-04-27 | 0.03 |
| 2018-04-30 | 0.03 |
| 2018-05-01 | 0.03 |
| 2018-05-02 | 0.03 |
| 2018-05-03 | 0.029 |
| 2018-05-04 | 0.03 |
| 2018-05-07 | 0.03 |
| 2018-05-08 | 0.03 |
| 2018-05-09 | 0.03 |
| 2018-05-10 | 0.03 |
| 2018-05-11 | 0.03 |
| 2018-05-14 | 0.03 |
| 2018-05-15 | 0.031 |
| 2018-05-16 | 0.031 |
| 2018-05-17 | 0.031 |
| 2018-05-18 | 0.031 |
| 2018-05-21 | 0.031 |
| 2018-05-22 | 0.031 |
| 2018-05-23 | 0.03 |
| 2018-05-24 | 0.03 |
| 2018-05-25 | 0.029 |
| 2018-05-28 | 0.029 |
| 2018-05-29 | 0.028 |
| 2018-05-30 | 0.028 |
| 2018-05-31 | 0.028 |
| 2018-06-01 | 0.029 |
| 2018-06-04 | 0.029 |
| 2018-06-05 | 0.029 |
| 2018-06-06 | 0.03 |
| 2018-06-07 | 0.029 |
| 2018-06-08 | 0.029 |
| 2018-06-11 | 0.03 |
| 2018-06-12 | 0.03 |
| 2018-06-13 | 0.03 |
| 2018-06-14 | 0.029 |
| 2018-06-15 | 0.029 |
| 2018-06-18 | 0.029 |
| 2018-06-19 | 0.029 |
| 2018-06-20 | 0.029 |
| 2018-06-21 | 0.029 |
| 2018-06-22 | 0.029 |
| 2018-06-25 | 0.029 |
| 2018-06-26 | 0.029 |
| 2018-06-27 | 0.028 |
| 2018-06-28 | 0.028 |
| 2018-06-29 | 0.028 |
| 2018-07-02 | 0.029 |
| 2018-07-03 | 0.028 |
| 2018-07-04 | 0.028 |
| 2018-07-05 | 0.028 |
| 2018-07-06 | 0.028 |
| 2018-07-09 | 0.029 |
| 2018-07-10 | 0.029 |
| 2018-07-11 | 0.028 |
| 2018-07-12 | 0.028 |
| 2018-07-13 | 0.028 |
| 2018-07-16 | 0.028 |
| 2018-07-17 | 0.029 |
| 2018-07-18 | 0.029 |
| 2018-07-19 | 0.028 |
| 2018-07-20 | 0.029 |
| 2018-07-23 | 0.03 |
| 2018-07-24 | 0.03 |
| 2018-07-25 | 0.029 |
| 2018-07-26 | 0.03 |
| 2018-07-27 | 0.03 |
| 2018-07-30 | 0.03 |
| 2018-07-31 | 0.03 |
| 2018-08-01 | 0.03 |
| 2018-08-02 | 0.03 |
| 2018-08-03 | 0.03 |
| 2018-08-06 | 0.029 |
| 2018-08-07 | 0.03 |
| 2018-08-08 | 0.03 |
| 2018-08-09 | 0.029 |
| 2018-08-10 | 0.029 |
| 2018-08-13 | 0.029 |
| 2018-08-14 | 0.029 |
| 2018-08-15 | 0.029 |
| 2018-08-16 | 0.029 |
| 2018-08-17 | 0.029 |
| 2018-08-20 | 0.028 |
| 2018-08-21 | 0.028 |
| 2018-08-22 | 0.028 |
| 2018-08-23 | 0.028 |
| 2018-08-24 | 0.028 |
| 2018-08-27 | 0.028 |
| 2018-08-28 | 0.029 |
| 2018-08-29 | 0.029 |
| 2018-08-30 | 0.029 |
| 2018-08-31 | 0.029 |
| 2018-09-03 | 0.029 |
| 2018-09-04 | 0.029 |
| 2018-09-05 | 0.029 |
| 2018-09-06 | 0.029 |
| 2018-09-07 | 0.029 |
| 2018-09-10 | 0.029 |
| 2018-09-11 | 0.03 |
| 2018-09-12 | 0.03 |
| 2018-09-13 | 0.03 |
| 2018-09-14 | 0.03 |
| 2018-09-17 | 0.03 |
| 2018-09-18 | 0.03 |
| 2018-09-19 | 0.031 |
| 2018-09-20 | 0.031 |
| 2018-09-21 | 0.031 |
| 2018-09-24 | 0.031 |
| 2018-09-25 | 0.031 |
| 2018-09-26 | 0.031 |
| 2018-09-27 | 0.031 |
| 2018-09-28 | 0.03 |
| 2018-10-01 | 0.031 |
| 2018-10-02 | 0.03 |
| 2018-10-03 | 0.032 |
| 2018-10-04 | 0.032 |
| 2018-10-05 | 0.032 |
| 2018-10-08 | 0.032 |
| 2018-10-09 | 0.032 |
| 2018-10-10 | 0.032 |
| 2018-10-11 | 0.031 |
| 2018-10-12 | 0.032 |
| 2018-10-15 | 0.032 |
| 2018-10-16 | 0.032 |
| 2018-10-17 | 0.032 |
| 2018-10-18 | 0.032 |
| 2018-10-19 | 0.032 |
| 2018-10-22 | 0.032 |
| 2018-10-23 | 0.032 |
| 2018-10-24 | 0.031 |
| 2018-10-25 | 0.031 |
| 2018-10-26 | 0.031 |
| 2018-10-29 | 0.031 |
| 2018-10-30 | 0.031 |
| 2018-10-31 | 0.032 |
| 2018-11-01 | 0.031 |
| 2018-11-02 | 0.032 |
| 2018-11-05 | 0.032 |
| 2018-11-06 | 0.032 |
| 2018-11-07 | 0.032 |
| 2018-11-08 | 0.032 |
| 2018-11-09 | 0.032 |
| 2018-11-12 | 0.032 |
| 2018-11-13 | 0.031 |
| 2018-11-14 | 0.031 |
| 2018-11-15 | 0.031 |
| 2018-11-16 | 0.031 |
| 2018-11-19 | 0.031 |
| 2018-11-20 | 0.031 |
| 2018-11-21 | 0.031 |
| 2018-11-22 | 0.031 |
| 2018-11-23 | 0.03 |
| 2018-11-26 | 0.031 |
| 2018-11-27 | 0.031 |
| 2018-11-28 | 0.031 |
| 2018-11-29 | 0.03 |
| 2018-11-30 | 0.03 |
| 2018-12-03 | 0.03 |
| 2018-12-04 | 0.029 |
| 2018-12-05 | 0.029 |
| 2018-12-06 | 0.029 |
| 2018-12-07 | 0.028 |
| 2018-12-10 | 0.028 |
| 2018-12-11 | 0.029 |
| 2018-12-12 | 0.029 |
| 2018-12-13 | 0.029 |
| 2018-12-14 | 0.029 |
| 2018-12-17 | 0.029 |
| 2018-12-18 | 0.028 |
| 2018-12-19 | 0.028 |
| 2018-12-20 | 0.028 |
| 2018-12-21 | 0.028 |
| 2018-12-24 | 0.027 |
| 2018-12-25 | 0.027 |
| 2018-12-26 | 0.028 |
| 2018-12-27 | 0.028 |
| 2018-12-28 | 0.027 |
| 2018-12-31 | 0.027 |
| 2019-01-01 | 0.027 |
| 2019-01-02 | 0.027 |
| 2019-01-03 | 0.026 |
| 2019-01-04 | 0.027 |
| 2019-01-07 | 0.027 |
| 2019-01-08 | 0.027 |
| 2019-01-09 | 0.027 |
| 2019-01-10 | 0.027 |
| 2019-01-11 | 0.027 |
| 2019-01-14 | 0.027 |
| 2019-01-15 | 0.027 |
| 2019-01-16 | 0.027 |
| 2019-01-17 | 0.028 |
| 2019-01-18 | 0.028 |
| 2019-01-21 | 0.028 |
| 2019-01-22 | 0.027 |
| 2019-01-23 | 0.028 |
| 2019-01-24 | 0.027 |
| 2019-01-25 | 0.028 |
| 2019-01-28 | 0.028 |
| 2019-01-29 | 0.027 |
| 2019-01-30 | 0.027 |
| 2019-01-31 | 0.026 |
| 2019-02-01 | 0.027 |
| 2019-02-04 | 0.027 |
| 2019-02-05 | 0.027 |
| 2019-02-06 | 0.027 |
| 2019-02-07 | 0.026 |
| 2019-02-08 | 0.026 |
| 2019-02-11 | 0.026 |
| 2019-02-12 | 0.027 |
| 2019-02-13 | 0.027 |
| 2019-02-14 | 0.027 |
| 2019-02-15 | 0.027 |
| 2019-02-18 | 0.027 |
| 2019-02-19 | 0.026 |
| 2019-02-20 | 0.026 |
| 2019-02-21 | 0.027 |
| 2019-02-22 | 0.026 |
| 2019-02-25 | 0.027 |
| 2019-02-26 | 0.026 |
| 2019-02-27 | 0.027 |
| 2019-02-28 | 0.027 |
| 2019-03-01 | 0.028 |
| 2019-03-04 | 0.027 |
| 2019-03-05 | 0.027 |
| 2019-03-06 | 0.027 |
| 2019-03-07 | 0.026 |
| 2019-03-08 | 0.026 |
| 2019-03-11 | 0.026 |
| 2019-03-12 | 0.026 |
| 2019-03-13 | 0.026 |
| 2019-03-14 | 0.026 |
| 2019-03-15 | 0.026 |
| 2019-03-18 | 0.026 |
| 2019-03-19 | 0.026 |
| 2019-03-20 | 0.025 |
| 2019-03-21 | 0.025 |
| 2019-03-22 | 0.024 |
| 2019-03-25 | 0.024 |
| 2019-03-26 | 0.024 |
| 2019-03-27 | 0.024 |
| 2019-03-28 | 0.024 |
| 2019-03-29 | 0.024 |
| 2019-04-01 | 0.025 |
| 2019-04-02 | 0.025 |
| 2019-04-03 | 0.025 |
| 2019-04-04 | 0.025 |
| 2019-04-05 | 0.025 |
| 2019-04-08 | 0.025 |
| 2019-04-09 | 0.025 |
| 2019-04-10 | 0.025 |
| 2019-04-11 | 0.025 |
| 2019-04-12 | 0.026 |
| 2019-04-15 | 0.026 |
| 2019-04-16 | 0.026 |
| 2019-04-17 | 0.026 |
| 2019-04-18 | 0.026 |
| 2019-04-19 | 0.026 |
| 2019-04-22 | 0.026 |
| 2019-04-23 | 0.026 |
| 2019-04-24 | 0.025 |
| 2019-04-25 | 0.025 |
| 2019-04-26 | 0.025 |
| 2019-04-29 | 0.025 |
| 2019-04-30 | 0.025 |
| 2019-05-01 | 0.025 |
| 2019-05-02 | 0.026 |
| 2019-05-03 | 0.025 |
| 2019-05-06 | 0.025 |
| 2019-05-07 | 0.024 |
| 2019-05-08 | 0.025 |
| 2019-05-09 | 0.024 |
| 2019-05-10 | 0.025 |
| 2019-05-13 | 0.024 |
| 2019-05-14 | 0.024 |
| 2019-05-15 | 0.024 |
| 2019-05-16 | 0.024 |
| 2019-05-17 | 0.024 |
| 2019-05-20 | 0.024 |
| 2019-05-21 | 0.024 |
| 2019-05-22 | 0.024 |
| 2019-05-23 | 0.023 |
| 2019-05-24 | 0.023 |
| 2019-05-27 | 0.023 |
| 2019-05-28 | 0.023 |
| 2019-05-29 | 0.022 |
| 2019-05-30 | 0.022 |
| 2019-05-31 | 0.021 |
| 2019-06-03 | 0.021 |
| 2019-06-04 | 0.021 |
| 2019-06-05 | 0.021 |
| 2019-06-06 | 0.021 |
| 2019-06-07 | 0.021 |
| 2019-06-10 | 0.022 |
| 2019-06-11 | 0.022 |
| 2019-06-12 | 0.021 |
| 2019-06-13 | 0.021 |
| 2019-06-14 | 0.021 |
| 2019-06-17 | 0.021 |
| 2019-06-18 | 0.021 |
| 2019-06-19 | 0.02 |
| 2019-06-20 | 0.02 |
| 2019-06-21 | 0.021 |
| 2019-06-24 | 0.02 |
| 2019-06-25 | 0.02 |
| 2019-06-26 | 0.02 |
| 2019-06-27 | 0.02 |
| 2019-06-28 | 0.02 |
| 2019-07-01 | 0.02 |
| 2019-07-02 | 0.02 |
| 2019-07-03 | 0.02 |
| 2019-07-04 | 0.02 |
| 2019-07-05 | 0.02 |
| 2019-07-08 | 0.02 |
| 2019-07-09 | 0.021 |
| 2019-07-10 | 0.021 |
| 2019-07-11 | 0.021 |
| 2019-07-12 | 0.021 |
| 2019-07-15 | 0.021 |
| 2019-07-16 | 0.021 |
| 2019-07-17 | 0.021 |
| 2019-07-18 | 0.02 |
| 2019-07-19 | 0.02 |
| 2019-07-22 | 0.02 |
| 2019-07-23 | 0.021 |
| 2019-07-24 | 0.02 |
| 2019-07-25 | 0.021 |
| 2019-07-26 | 0.021 |
| 2019-07-29 | 0.021 |
| 2019-07-30 | 0.021 |
| 2019-07-31 | 0.02 |
| 2019-08-01 | 0.019 |
| 2019-08-02 | 0.019 |
| 2019-08-05 | 0.018 |
| 2019-08-06 | 0.017 |
| 2019-08-07 | 0.017 |
| 2019-08-08 | 0.017 |
| 2019-08-09 | 0.017 |
| 2019-08-12 | 0.016 |
| 2019-08-13 | 0.017 |
| 2019-08-14 | 0.016 |
| 2019-08-15 | 0.015 |
| 2019-08-16 | 0.016 |
| 2019-08-19 | 0.016 |
| 2019-08-20 | 0.016 |
| 2019-08-21 | 0.016 |
| 2019-08-22 | 0.016 |
| 2019-08-23 | 0.015 |
| 2019-08-26 | 0.015 |
| 2019-08-27 | 0.015 |
| 2019-08-28 | 0.015 |
| 2019-08-29 | 0.015 |
| 2019-08-30 | 0.015 |
| 2019-09-02 | 0.015 |
| 2019-09-03 | 0.015 |
| 2019-09-04 | 0.015 |
| 2019-09-05 | 0.016 |
| 2019-09-06 | 0.016 |
| 2019-09-09 | 0.016 |
| 2019-09-10 | 0.017 |
| 2019-09-11 | 0.018 |
| 2019-09-12 | 0.018 |
| 2019-09-13 | 0.019 |
| 2019-09-16 | 0.018 |
| 2019-09-17 | 0.018 |
| 2019-09-18 | 0.018 |
| 2019-09-19 | 0.018 |
| 2019-09-20 | 0.017 |
| 2019-09-23 | 0.017 |
| 2019-09-24 | 0.016 |
| 2019-09-25 | 0.017 |
| 2019-09-26 | 0.017 |
| 2019-09-27 | 0.017 |
| 2019-09-30 | 0.017 |
| 2019-10-01 | 0.016 |
| 2019-10-02 | 0.016 |
| 2019-10-03 | 0.015 |
| 2019-10-04 | 0.015 |
| 2019-10-07 | 0.016 |
| 2019-10-08 | 0.015 |
| 2019-10-09 | 0.016 |
| 2019-10-10 | 0.017 |
| 2019-10-11 | 0.018 |
| 2019-10-14 | 0.018 |
| 2019-10-15 | 0.018 |
| 2019-10-16 | 0.018 |
| 2019-10-17 | 0.018 |
| 2019-10-18 | 0.018 |
| 2019-10-21 | 0.018 |
| 2019-10-22 | 0.018 |
| 2019-10-23 | 0.018 |
| 2019-10-24 | 0.018 |
| 2019-10-25 | 0.018 |
| 2019-10-28 | 0.019 |
| 2019-10-29 | 0.018 |
| 2019-10-30 | 0.018 |
| 2019-10-31 | 0.017 |
| 2019-11-01 | 0.017 |
| 2019-11-04 | 0.018 |
| 2019-11-05 | 0.019 |
| 2019-11-06 | 0.018 |
| 2019-11-07 | 0.019 |
| 2019-11-08 | 0.019 |
| 2019-11-11 | 0.019 |
| 2019-11-12 | 0.019 |
| 2019-11-13 | 0.019 |
| 2019-11-14 | 0.018 |
| 2019-11-15 | 0.018 |
| 2019-11-18 | 0.018 |
| 2019-11-19 | 0.018 |
| 2019-11-20 | 0.017 |
| 2019-11-21 | 0.018 |
| 2019-11-22 | 0.018 |
| 2019-11-25 | 0.018 |
| 2019-11-26 | 0.017 |
| 2019-11-27 | 0.018 |
| 2019-11-28 | 0.018 |
| 2019-11-29 | 0.018 |
| 2019-12-02 | 0.018 |
| 2019-12-03 | 0.017 |
| 2019-12-04 | 0.018 |
| 2019-12-05 | 0.018 |
| 2019-12-06 | 0.018 |
| 2019-12-09 | 0.018 |
| 2019-12-10 | 0.019 |
| 2019-12-11 | 0.018 |
| 2019-12-12 | 0.019 |
| 2019-12-13 | 0.018 |
| 2019-12-16 | 0.019 |
| 2019-12-17 | 0.019 |
| 2019-12-18 | 0.019 |
| 2019-12-19 | 0.019 |
| 2019-12-20 | 0.019 |
| 2019-12-23 | 0.019 |
| 2019-12-24 | 0.019 |
| 2019-12-25 | 0.019 |
| 2019-12-26 | 0.019 |
| 2019-12-27 | 0.019 |
| 2019-12-30 | 0.019 |
| 2019-12-31 | 0.019 |
| 2020-01-01 | 0.019 |
| 2020-01-02 | 0.019 |
| 2020-01-03 | 0.018 |
| 2020-01-06 | 0.018 |
| 2020-01-07 | 0.018 |
| 2020-01-08 | 0.019 |
| 2020-01-09 | 0.019 |
| 2020-01-10 | 0.018 |
| 2020-01-13 | 0.019 |
| 2020-01-14 | 0.018 |
| 2020-01-15 | 0.018 |
| 2020-01-16 | 0.018 |
| 2020-01-17 | 0.018 |
| 2020-01-20 | 0.018 |
| 2020-01-21 | 0.018 |
| 2020-01-22 | 0.018 |
| 2020-01-23 | 0.017 |
| 2020-01-24 | 0.017 |
| 2020-01-27 | 0.016 |
| 2020-01-28 | 0.016 |
| 2020-01-29 | 0.016 |
| 2020-01-30 | 0.016 |
| 2020-01-31 | 0.015 |
| 2020-02-03 | 0.015 |
| 2020-02-04 | 0.016 |
| 2020-02-05 | 0.017 |
| 2020-02-06 | 0.016 |
| 2020-02-07 | 0.016 |
| 2020-02-10 | 0.016 |
| 2020-02-11 | 0.016 |
| 2020-02-12 | 0.016 |
| 2020-02-13 | 0.016 |
| 2020-02-14 | 0.016 |
| 2020-02-17 | 0.016 |
| 2020-02-18 | 0.016 |
| 2020-02-19 | 0.016 |
| 2020-02-20 | 0.015 |
| 2020-02-21 | 0.015 |
| 2020-02-24 | 0.014 |
| 2020-02-25 | 0.013 |
| 2020-02-26 | 0.013 |
| 2020-02-27 | 0.013 |
| 2020-02-28 | 0.011 |
| 2020-03-02 | 0.011 |
| 2020-03-03 | 0.01 |
| 2020-03-04 | 0.01 |
| 2020-03-05 | 0.009 |
| 2020-03-06 | 0.007 |
| 2020-03-09 | 0.005 |
| 2020-03-10 | 0.008 |
| 2020-03-11 | 0.008 |
| 2020-03-12 | 0.009 |
| 2020-03-13 | 0.009 |
| 2020-03-16 | 0.007 |
| 2020-03-17 | 0.01 |
| 2020-03-18 | 0.012 |
| 2020-03-19 | 0.011 |
| 2020-03-20 | 0.009 |
| 2020-03-23 | 0.008 |
| 2020-03-24 | 0.008 |
| 2020-03-25 | 0.009 |
| 2020-03-26 | 0.008 |
| 2020-03-27 | 0.007 |
| 2020-03-30 | 0.007 |
| 2020-03-31 | 0.007 |
| 2020-04-01 | 0.006 |
| 2020-04-02 | 0.006 |
| 2020-04-03 | 0.006 |
| 2020-04-06 | 0.007 |
| 2020-04-07 | 0.008 |
| 2020-04-08 | 0.008 |
| 2020-04-09 | 0.007 |
| 2020-04-10 | 0.007 |
| 2020-04-13 | 0.008 |
| 2020-04-14 | 0.008 |
| 2020-04-15 | 0.006 |
| 2020-04-16 | 0.006 |
| 2020-04-17 | 0.007 |
| 2020-04-20 | 0.006 |
| 2020-04-21 | 0.006 |
| 2020-04-22 | 0.006 |
| 2020-04-23 | 0.006 |
| 2020-04-24 | 0.006 |
| 2020-04-27 | 0.007 |
| 2020-04-28 | 0.006 |
| 2020-04-29 | 0.006 |
| 2020-04-30 | 0.006 |
| 2020-05-01 | 0.006 |
| 2020-05-04 | 0.006 |
| 2020-05-05 | 0.007 |
| 2020-05-06 | 0.007 |
| 2020-05-07 | 0.006 |
| 2020-05-08 | 0.007 |
| 2020-05-11 | 0.007 |
| 2020-05-12 | 0.007 |
| 2020-05-13 | 0.006 |
| 2020-05-14 | 0.006 |
| 2020-05-15 | 0.006 |
| 2020-05-18 | 0.007 |
| 2020-05-19 | 0.007 |
| 2020-05-20 | 0.007 |
| 2020-05-21 | 0.007 |
| 2020-05-22 | 0.007 |
| 2020-05-25 | 0.007 |
| 2020-05-26 | 0.007 |
| 2020-05-27 | 0.007 |
| 2020-05-28 | 0.007 |
| 2020-05-29 | 0.007 |
| 2020-06-01 | 0.007 |
| 2020-06-02 | 0.007 |
| 2020-06-03 | 0.008 |
| 2020-06-04 | 0.008 |
| 2020-06-05 | 0.009 |
| 2020-06-08 | 0.009 |
| 2020-06-09 | 0.008 |
| 2020-06-10 | 0.008 |
| 2020-06-11 | 0.007 |
| 2020-06-12 | 0.007 |
| 2020-06-15 | 0.007 |
| 2020-06-16 | 0.008 |
| 2020-06-17 | 0.007 |
| 2020-06-18 | 0.007 |
| 2020-06-19 | 0.007 |
| 2020-06-22 | 0.007 |
| 2020-06-23 | 0.007 |
| 2020-06-24 | 0.007 |
| 2020-06-25 | 0.007 |
| 2020-06-26 | 0.006 |
| 2020-06-29 | 0.006 |
| 2020-06-30 | 0.007 |
| 2020-07-01 | 0.007 |
| 2020-07-02 | 0.007 |
| 2020-07-03 | 0.007 |
| 2020-07-06 | 0.007 |
| 2020-07-07 | 0.007 |
| 2020-07-08 | 0.007 |
| 2020-07-09 | 0.006 |
| 2020-07-10 | 0.007 |
| 2020-07-13 | 0.006 |
| 2020-07-14 | 0.006 |
| 2020-07-15 | 0.006 |
| 2020-07-16 | 0.006 |
| 2020-07-17 | 0.006 |
| 2020-07-20 | 0.006 |
| 2020-07-21 | 0.006 |
| 2020-07-22 | 0.006 |
| 2020-07-23 | 0.006 |
| 2020-07-24 | 0.006 |
| 2020-07-27 | 0.006 |
| 2020-07-28 | 0.006 |
| 2020-07-29 | 0.006 |
| 2020-07-30 | 0.006 |
| 2020-07-31 | 0.006 |
| 2020-08-03 | 0.006 |
| 2020-08-04 | 0.005 |
| 2020-08-05 | 0.006 |
| 2020-08-06 | 0.006 |
| 2020-08-07 | 0.006 |
| 2020-08-10 | 0.006 |
| 2020-08-11 | 0.006 |
| 2020-08-12 | 0.007 |
| 2020-08-13 | 0.007 |
| 2020-08-14 | 0.007 |
| 2020-08-17 | 0.007 |
| 2020-08-18 | 0.007 |
| 2020-08-19 | 0.007 |
| 2020-08-20 | 0.007 |
| 2020-08-21 | 0.006 |
| 2020-08-24 | 0.007 |
| 2020-08-25 | 0.007 |
| 2020-08-26 | 0.007 |
| 2020-08-27 | 0.007 |
| 2020-08-28 | 0.007 |
| 2020-08-31 | 0.007 |
| 2020-09-01 | 0.007 |
| 2020-09-02 | 0.007 |
| 2020-09-03 | 0.006 |
| 2020-09-04 | 0.007 |
| 2020-09-07 | 0.007 |
| 2020-09-08 | 0.007 |
| 2020-09-09 | 0.007 |
| 2020-09-10 | 0.007 |
| 2020-09-11 | 0.007 |
| 2020-09-14 | 0.007 |
| 2020-09-15 | 0.007 |
| 2020-09-16 | 0.007 |
| 2020-09-17 | 0.007 |
| 2020-09-18 | 0.007 |
| 2020-09-21 | 0.007 |
| 2020-09-22 | 0.007 |
| 2020-09-23 | 0.007 |
| 2020-09-24 | 0.007 |
| 2020-09-25 | 0.007 |
| 2020-09-28 | 0.007 |
| 2020-09-29 | 0.007 |
| 2020-09-30 | 0.007 |
| 2020-10-01 | 0.007 |
| 2020-10-02 | 0.007 |
| 2020-10-05 | 0.008 |
| 2020-10-06 | 0.008 |
| 2020-10-07 | 0.008 |
| 2020-10-08 | 0.008 |
| 2020-10-09 | 0.008 |
| 2020-10-12 | 0.008 |
| 2020-10-13 | 0.007 |
| 2020-10-14 | 0.007 |
| 2020-10-15 | 0.007 |
| 2020-10-16 | 0.008 |
| 2020-10-19 | 0.008 |
| 2020-10-20 | 0.008 |
| 2020-10-21 | 0.008 |
| 2020-10-22 | 0.009 |
| 2020-10-23 | 0.008 |
| 2020-10-26 | 0.008 |
| 2020-10-27 | 0.008 |
| 2020-10-28 | 0.008 |
| 2020-10-29 | 0.008 |
| 2020-10-30 | 0.009 |
| 2020-11-02 | 0.009 |
| 2020-11-03 | 0.009 |
| 2020-11-04 | 0.008 |
| 2020-11-05 | 0.008 |
| 2020-11-06 | 0.008 |
| 2020-11-09 | 0.01 |
| 2020-11-10 | 0.01 |
| 2020-11-11 | 0.01 |
| 2020-11-12 | 0.009 |
| 2020-11-13 | 0.009 |
| 2020-11-16 | 0.009 |
| 2020-11-17 | 0.009 |
| 2020-11-18 | 0.009 |
| 2020-11-19 | 0.009 |
| 2020-11-20 | 0.008 |
| 2020-11-23 | 0.009 |
| 2020-11-24 | 0.009 |
| 2020-11-25 | 0.009 |
| 2020-11-26 | 0.009 |
| 2020-11-27 | 0.008 |
| 2020-11-30 | 0.008 |
| 2020-12-01 | 0.009 |
| 2020-12-02 | 0.01 |
| 2020-12-03 | 0.009 |
| 2020-12-04 | 0.01 |
| 2020-12-07 | 0.009 |
| 2020-12-08 | 0.009 |
| 2020-12-09 | 0.01 |
| 2020-12-10 | 0.009 |
| 2020-12-11 | 0.009 |
| 2020-12-14 | 0.009 |
| 2020-12-15 | 0.009 |
| 2020-12-16 | 0.009 |
| 2020-12-17 | 0.009 |
| 2020-12-18 | 0.01 |
| 2020-12-21 | 0.01 |
| 2020-12-22 | 0.009 |
| 2020-12-23 | 0.01 |
| 2020-12-24 | 0.009 |
| 2020-12-25 | 0.009 |
| 2020-12-28 | 0.009 |
| 2020-12-29 | 0.009 |
| 2020-12-30 | 0.009 |
| 2020-12-31 | 0.009 |
| 2021-01-01 | 0.009 |
| 2021-01-04 | 0.009 |
| 2021-01-05 | 0.01 |
| 2021-01-06 | 0.01 |
| 2021-01-07 | 0.011 |
| 2021-01-08 | 0.011 |
| 2021-01-11 | 0.012 |
| 2021-01-12 | 0.012 |
| 2021-01-13 | 0.011 |
| 2021-01-14 | 0.012 |
| 2021-01-15 | 0.011 |
| 2021-01-18 | 0.011 |
| 2021-01-19 | 0.011 |
| 2021-01-20 | 0.011 |
| 2021-01-21 | 0.011 |
| 2021-01-22 | 0.011 |
| 2021-01-25 | 0.01 |
| 2021-01-26 | 0.01 |
| 2021-01-27 | 0.01 |
| 2021-01-28 | 0.011 |
| 2021-01-29 | 0.011 |
| 2021-02-01 | 0.011 |
| 2021-02-02 | 0.011 |
| 2021-02-03 | 0.012 |
| 2021-02-04 | 0.012 |
| 2021-02-05 | 0.012 |
| 2021-02-08 | 0.012 |
| 2021-02-09 | 0.012 |
| 2021-02-10 | 0.012 |
| 2021-02-11 | 0.012 |
| 2021-02-12 | 0.012 |
| 2021-02-15 | 0.012 |
| 2021-02-16 | 0.013 |
| 2021-02-17 | 0.013 |
| 2021-02-18 | 0.013 |
| 2021-02-19 | 0.013 |
| 2021-02-22 | 0.014 |
| 2021-02-23 | 0.014 |
| 2021-02-24 | 0.014 |
| 2021-02-25 | 0.015 |
| 2021-02-26 | 0.014 |
| 2021-03-01 | 0.014 |
| 2021-03-02 | 0.014 |
| 2021-03-03 | 0.015 |
| 2021-03-04 | 0.015 |
| 2021-03-05 | 0.016 |
| 2021-03-08 | 0.016 |
| 2021-03-09 | 0.016 |
| 2021-03-10 | 0.015 |
| 2021-03-11 | 0.015 |
| 2021-03-12 | 0.016 |
| 2021-03-15 | 0.016 |
| 2021-03-16 | 0.016 |
| 2021-03-17 | 0.016 |
| 2021-03-18 | 0.017 |
| 2021-03-19 | 0.017 |
| 2021-03-22 | 0.017 |
| 2021-03-23 | 0.016 |
| 2021-03-24 | 0.016 |
| 2021-03-25 | 0.016 |
| 2021-03-26 | 0.017 |
| 2021-03-29 | 0.017 |
| 2021-03-30 | 0.017 |
| 2021-03-31 | 0.017 |
| 2021-04-01 | 0.017 |
| 2021-04-02 | 0.017 |
| 2021-04-05 | 0.017 |
| 2021-04-06 | 0.017 |
| 2021-04-07 | 0.017 |
| 2021-04-08 | 0.016 |
| 2021-04-09 | 0.017 |
| 2021-04-12 | 0.017 |
| 2021-04-13 | 0.016 |
| 2021-04-14 | 0.016 |
| 2021-04-15 | 0.016 |
| 2021-04-16 | 0.016 |
| 2021-04-19 | 0.016 |
| 2021-04-20 | 0.016 |
| 2021-04-21 | 0.016 |
| 2021-04-22 | 0.016 |
| 2021-04-23 | 0.016 |
| 2021-04-26 | 0.016 |
| 2021-04-27 | 0.016 |
| 2021-04-28 | 0.016 |
| 2021-04-29 | 0.016 |
| 2021-04-30 | 0.016 |
| 2021-05-03 | 0.016 |
| 2021-05-04 | 0.016 |
| 2021-05-05 | 0.016 |
| 2021-05-06 | 0.016 |
| 2021-05-07 | 0.016 |
| 2021-05-10 | 0.016 |
| 2021-05-11 | 0.016 |
| 2021-05-12 | 0.017 |
| 2021-05-13 | 0.017 |
| 2021-05-14 | 0.016 |
| 2021-05-17 | 0.016 |
| 2021-05-18 | 0.016 |
| 2021-05-19 | 0.017 |
| 2021-05-20 | 0.016 |
| 2021-05-21 | 0.016 |
| 2021-05-24 | 0.016 |
| 2021-05-25 | 0.016 |
| 2021-05-26 | 0.016 |
| 2021-05-27 | 0.016 |
| 2021-05-28 | 0.016 |
| 2021-05-31 | 0.016 |
| 2021-06-01 | 0.016 |
| 2021-06-02 | 0.016 |
| 2021-06-03 | 0.016 |
| 2021-06-04 | 0.016 |
| 2021-06-07 | 0.016 |
| 2021-06-08 | 0.015 |
| 2021-06-09 | 0.015 |
| 2021-06-10 | 0.014 |
| 2021-06-11 | 0.015 |
| 2021-06-14 | 0.015 |
| 2021-06-15 | 0.015 |
| 2021-06-16 | 0.016 |
| 2021-06-17 | 0.015 |
| 2021-06-18 | 0.014 |
| 2021-06-21 | 0.015 |
| 2021-06-22 | 0.015 |
| 2021-06-23 | 0.015 |
| 2021-06-24 | 0.015 |
| 2021-06-25 | 0.015 |
| 2021-06-28 | 0.015 |
| 2021-06-29 | 0.015 |
| 2021-06-30 | 0.014 |
| 2021-07-01 | 0.015 |
| 2021-07-02 | 0.014 |
| 2021-07-05 | 0.014 |
| 2021-07-06 | 0.014 |
| 2021-07-07 | 0.013 |
| 2021-07-08 | 0.013 |
| 2021-07-09 | 0.014 |
| 2021-07-12 | 0.014 |
| 2021-07-13 | 0.014 |
| 2021-07-14 | 0.014 |
| 2021-07-15 | 0.013 |
| 2021-07-16 | 0.013 |
| 2021-07-19 | 0.012 |
| 2021-07-20 | 0.012 |
| 2021-07-21 | 0.013 |
| 2021-07-22 | 0.013 |
| 2021-07-23 | 0.013 |
| 2021-07-26 | 0.013 |
| 2021-07-27 | 0.012 |
| 2021-07-28 | 0.013 |
| 2021-07-29 | 0.013 |
| 2021-07-30 | 0.012 |
| 2021-08-02 | 0.012 |
| 2021-08-03 | 0.012 |
| 2021-08-04 | 0.012 |
| 2021-08-05 | 0.012 |
| 2021-08-06 | 0.013 |
| 2021-08-09 | 0.013 |
| 2021-08-10 | 0.014 |
| 2021-08-11 | 0.014 |
| 2021-08-12 | 0.014 |
| 2021-08-13 | 0.013 |
| 2021-08-16 | 0.013 |
| 2021-08-17 | 0.013 |
| 2021-08-18 | 0.013 |
| 2021-08-19 | 0.012 |
| 2021-08-20 | 0.013 |
| 2021-08-23 | 0.012 |
| 2021-08-24 | 0.013 |
| 2021-08-25 | 0.014 |
| 2021-08-26 | 0.013 |
| 2021-08-27 | 0.013 |
| 2021-08-30 | 0.013 |
| 2021-08-31 | 0.013 |
| 2021-09-01 | 0.013 |
| 2021-09-02 | 0.013 |
| 2021-09-03 | 0.013 |
| 2021-09-06 | 0.013 |
| 2021-09-07 | 0.014 |
| 2021-09-08 | 0.014 |
| 2021-09-09 | 0.013 |
| 2021-09-10 | 0.014 |
| 2021-09-13 | 0.013 |
| 2021-09-14 | 0.013 |
| 2021-09-15 | 0.013 |
| 2021-09-16 | 0.013 |
| 2021-09-17 | 0.014 |
| 2021-09-20 | 0.013 |
| 2021-09-21 | 0.013 |
| 2021-09-22 | 0.013 |
| 2021-09-23 | 0.014 |
| 2021-09-24 | 0.015 |
| 2021-09-27 | 0.015 |
| 2021-09-28 | 0.015 |
| 2021-09-29 | 0.016 |
| 2021-09-30 | 0.015 |
| 2021-10-01 | 0.015 |
| 2021-10-04 | 0.015 |
| 2021-10-05 | 0.015 |
| 2021-10-06 | 0.015 |
| 2021-10-07 | 0.016 |
| 2021-10-08 | 0.016 |
| 2021-10-11 | 0.016 |
| 2021-10-12 | 0.016 |
| 2021-10-13 | 0.016 |
| 2021-10-14 | 0.015 |
| 2021-10-15 | 0.016 |
| 2021-10-18 | 0.016 |
| 2021-10-19 | 0.016 |
| 2021-10-20 | 0.016 |
| 2021-10-21 | 0.017 |
| 2021-10-22 | 0.017 |
| 2021-10-25 | 0.016 |
| 2021-10-26 | 0.016 |
| 2021-10-27 | 0.015 |
| 2021-10-28 | 0.016 |
| 2021-10-29 | 0.016 |
| 2021-11-01 | 0.016 |
| 2021-11-02 | 0.016 |
| 2021-11-03 | 0.016 |
| 2021-11-04 | 0.015 |
| 2021-11-05 | 0.014 |
| 2021-11-08 | 0.015 |
| 2021-11-09 | 0.015 |
| 2021-11-10 | 0.016 |
| 2021-11-11 | 0.016 |
| 2021-11-12 | 0.016 |
| 2021-11-15 | 0.016 |
| 2021-11-16 | 0.016 |
| 2021-11-17 | 0.016 |
| 2021-11-18 | 0.016 |
| 2021-11-19 | 0.015 |
| 2021-11-22 | 0.016 |
| 2021-11-23 | 0.017 |
| 2021-11-24 | 0.016 |
| 2021-11-25 | 0.016 |
| 2021-11-26 | 0.015 |
| 2021-11-29 | 0.015 |
| 2021-11-30 | 0.014 |
| 2021-12-01 | 0.014 |
| 2021-12-02 | 0.014 |
| 2021-12-03 | 0.014 |
| 2021-12-06 | 0.014 |
| 2021-12-07 | 0.015 |
| 2021-12-08 | 0.015 |
| 2021-12-09 | 0.015 |
| 2021-12-10 | 0.015 |
| 2021-12-13 | 0.014 |
| 2021-12-14 | 0.014 |
| 2021-12-15 | 0.015 |
| 2021-12-16 | 0.014 |
| 2021-12-17 | 0.014 |
| 2021-12-20 | 0.014 |
| 2021-12-21 | 0.015 |
| 2021-12-22 | 0.015 |
| 2021-12-23 | 0.015 |
| 2021-12-24 | 0.015 |
| 2021-12-27 | 0.015 |
| 2021-12-28 | 0.015 |
| 2021-12-29 | 0.016 |
| 2021-12-30 | 0.015 |
| 2021-12-31 | 0.015 |
| 2022-01-03 | 0.016 |
| 2022-01-04 | 0.017 |
| 2022-01-05 | 0.017 |
| 2022-01-06 | 0.017 |
| 2022-01-07 | 0.018 |
| 2022-01-10 | 0.018 |
| 2022-01-11 | 0.018 |
| 2022-01-12 | 0.017 |
| 2022-01-13 | 0.017 |
| 2022-01-14 | 0.018 |
| 2022-01-17 | 0.018 |
| 2022-01-18 | 0.019 |
| 2022-01-19 | 0.018 |
| 2022-01-20 | 0.018 |
| 2022-01-21 | 0.018 |
| 2022-01-24 | 0.018 |
| 2022-01-25 | 0.018 |
| 2022-01-26 | 0.019 |
| 2022-01-27 | 0.018 |
| 2022-01-28 | 0.018 |
| 2022-01-31 | 0.018 |
| 2022-02-01 | 0.018 |
| 2022-02-02 | 0.018 |
| 2022-02-03 | 0.018 |
| 2022-02-04 | 0.019 |
| 2022-02-07 | 0.019 |
| 2022-02-08 | 0.02 |
| 2022-02-09 | 0.019 |
| 2022-02-10 | 0.02 |
| 2022-02-11 | 0.019 |
| 2022-02-14 | 0.02 |
| 2022-02-15 | 0.02 |
| 2022-02-16 | 0.02 |
| 2022-02-17 | 0.02 |
| 2022-02-18 | 0.019 |
| 2022-02-21 | 0.019 |
| 2022-02-22 | 0.019 |
| 2022-02-23 | 0.02 |
| 2022-02-24 | 0.02 |
| 2022-02-25 | 0.02 |
| 2022-02-28 | 0.018 |
| 2022-03-01 | 0.017 |
| 2022-03-02 | 0.019 |
| 2022-03-03 | 0.019 |
| 2022-03-04 | 0.017 |
| 2022-03-07 | 0.018 |
| 2022-03-08 | 0.019 |
| 2022-03-09 | 0.019 |
| 2022-03-10 | 0.02 |
| 2022-03-11 | 0.02 |
| 2022-03-14 | 0.021 |
| 2022-03-15 | 0.022 |
| 2022-03-16 | 0.022 |
| 2022-03-17 | 0.022 |
| 2022-03-18 | 0.021 |
| 2022-03-21 | 0.023 |
| 2022-03-22 | 0.024 |
| 2022-03-23 | 0.023 |
| 2022-03-24 | 0.023 |
| 2022-03-25 | 0.025 |
| 2022-03-28 | 0.025 |
| 2022-03-29 | 0.024 |
| 2022-03-30 | 0.024 |
| 2022-03-31 | 0.023 |
| 2022-04-01 | 0.024 |
| 2022-04-04 | 0.024 |
| 2022-04-05 | 0.025 |
| 2022-04-06 | 0.026 |
| 2022-04-07 | 0.027 |
| 2022-04-08 | 0.027 |
| 2022-04-11 | 0.028 |
| 2022-04-12 | 0.027 |
| 2022-04-13 | 0.027 |
| 2022-04-14 | 0.028 |
| 2022-04-15 | 0.028 |
| 2022-04-18 | 0.028 |
| 2022-04-19 | 0.029 |
| 2022-04-20 | 0.028 |
| 2022-04-21 | 0.029 |
| 2022-04-22 | 0.029 |
| 2022-04-25 | 0.028 |
| 2022-04-26 | 0.028 |
| 2022-04-27 | 0.028 |
| 2022-04-28 | 0.028 |
| 2022-04-29 | 0.029 |
| 2022-05-02 | 0.03 |
| 2022-05-03 | 0.03 |
| 2022-05-04 | 0.029 |
| 2022-05-05 | 0.03 |
| 2022-05-06 | 0.031 |
| 2022-05-09 | 0.03 |
| 2022-05-10 | 0.03 |
| 2022-05-11 | 0.029 |
| 2022-05-12 | 0.028 |
| 2022-05-13 | 0.029 |
| 2022-05-16 | 0.029 |
| 2022-05-17 | 0.03 |
| 2022-05-18 | 0.029 |
| 2022-05-19 | 0.028 |
| 2022-05-20 | 0.028 |
| 2022-05-23 | 0.029 |
| 2022-05-24 | 0.028 |
| 2022-05-25 | 0.028 |
| 2022-05-26 | 0.028 |
| 2022-05-27 | 0.027 |
| 2022-05-30 | 0.027 |
| 2022-05-31 | 0.028 |
| 2022-06-01 | 0.029 |
| 2022-06-02 | 0.029 |
| 2022-06-03 | 0.03 |
| 2022-06-06 | 0.03 |
| 2022-06-07 | 0.03 |
| 2022-06-08 | 0.03 |
| 2022-06-09 | 0.03 |
| 2022-06-10 | 0.032 |
| 2022-06-13 | 0.034 |
| 2022-06-14 | 0.035 |
| 2022-06-15 | 0.033 |
| 2022-06-16 | 0.033 |
| 2022-06-17 | 0.032 |
| 2022-06-20 | 0.032 |
| 2022-06-21 | 0.033 |
| 2022-06-22 | 0.032 |
| 2022-06-23 | 0.031 |
| 2022-06-24 | 0.031 |
| 2022-06-27 | 0.032 |
| 2022-06-28 | 0.032 |
| 2022-06-29 | 0.031 |
| 2022-06-30 | 0.03 |
| 2022-07-01 | 0.029 |
| 2022-07-04 | 0.029 |
| 2022-07-05 | 0.028 |
| 2022-07-06 | 0.029 |
| 2022-07-07 | 0.03 |
| 2022-07-08 | 0.031 |
| 2022-07-11 | 0.03 |
| 2022-07-12 | 0.03 |
| 2022-07-13 | 0.029 |
| 2022-07-14 | 0.03 |
| 2022-07-15 | 0.029 |
| 2022-07-18 | 0.03 |
| 2022-07-19 | 0.03 |
| 2022-07-20 | 0.03 |
| 2022-07-21 | 0.029 |
| 2022-07-22 | 0.028 |
| 2022-07-25 | 0.028 |
| 2022-07-26 | 0.028 |
| 2022-07-27 | 0.028 |
| 2022-07-28 | 0.027 |
| 2022-07-29 | 0.027 |
| 2022-08-01 | 0.026 |
| 2022-08-02 | 0.028 |
| 2022-08-03 | 0.027 |
| 2022-08-04 | 0.027 |
| 2022-08-05 | 0.028 |
| 2022-08-08 | 0.028 |
| 2022-08-09 | 0.028 |
| 2022-08-10 | 0.028 |
| 2022-08-11 | 0.029 |
| 2022-08-12 | 0.028 |
| 2022-08-15 | 0.028 |
| 2022-08-16 | 0.028 |
| 2022-08-17 | 0.029 |
| 2022-08-18 | 0.029 |
| 2022-08-19 | 0.03 |
| 2022-08-22 | 0.03 |
| 2022-08-23 | 0.03 |
| 2022-08-24 | 0.031 |
| 2022-08-25 | 0.03 |
| 2022-08-26 | 0.03 |
| 2022-08-29 | 0.031 |
| 2022-08-30 | 0.031 |
| 2022-08-31 | 0.032 |
| 2022-09-01 | 0.033 |
| 2022-09-02 | 0.032 |
| 2022-09-05 | 0.032 |
| 2022-09-06 | 0.033 |
| 2022-09-07 | 0.033 |
| 2022-09-08 | 0.033 |
| 2022-09-09 | 0.033 |
| 2022-09-12 | 0.034 |
| 2022-09-13 | 0.034 |
| 2022-09-14 | 0.034 |
| 2022-09-15 | 0.034 |
| 2022-09-16 | 0.034 |
| 2022-09-19 | 0.035 |
| 2022-09-20 | 0.036 |
| 2022-09-21 | 0.035 |
| 2022-09-22 | 0.037 |
| 2022-09-23 | 0.037 |
| 2022-09-26 | 0.039 |
| 2022-09-27 | 0.04 |
| 2022-09-28 | 0.037 |
| 2022-09-29 | 0.038 |
| 2022-09-30 | 0.038 |
| 2022-10-03 | 0.037 |
| 2022-10-04 | 0.036 |
| 2022-10-05 | 0.038 |
| 2022-10-06 | 0.038 |
| 2022-10-07 | 0.039 |
| 2022-10-10 | 0.039 |
| 2022-10-11 | 0.039 |
| 2022-10-12 | 0.039 |
| 2022-10-13 | 0.04 |
| 2022-10-14 | 0.04 |
| 2022-10-17 | 0.04 |
| 2022-10-18 | 0.04 |
| 2022-10-19 | 0.041 |
| 2022-10-20 | 0.042 |
| 2022-10-21 | 0.042 |
| 2022-10-24 | 0.042 |
| 2022-10-25 | 0.041 |
| 2022-10-26 | 0.04 |
| 2022-10-27 | 0.04 |
| 2022-10-28 | 0.04 |
| 2022-10-31 | 0.041 |
| 2022-11-01 | 0.041 |
| 2022-11-02 | 0.041 |
| 2022-11-03 | 0.041 |
| 2022-11-04 | 0.042 |
| 2022-11-07 | 0.042 |
| 2022-11-08 | 0.041 |
| 2022-11-09 | 0.041 |
| 2022-11-10 | 0.038 |
| 2022-11-11 | 0.038 |
| 2022-11-14 | 0.039 |
| 2022-11-15 | 0.038 |
| 2022-11-16 | 0.037 |
| 2022-11-17 | 0.038 |
| 2022-11-18 | 0.038 |
| 2022-11-21 | 0.038 |
| 2022-11-22 | 0.038 |
| 2022-11-23 | 0.037 |
| 2022-11-24 | 0.037 |
| 2022-11-25 | 0.037 |
| 2022-11-28 | 0.037 |
| 2022-11-29 | 0.038 |
| 2022-11-30 | 0.037 |
| 2022-12-01 | 0.035 |
| 2022-12-02 | 0.035 |
| 2022-12-05 | 0.036 |
| 2022-12-06 | 0.035 |
| 2022-12-07 | 0.034 |
| 2022-12-08 | 0.035 |
| 2022-12-09 | 0.036 |
| 2022-12-12 | 0.036 |
| 2022-12-13 | 0.035 |
| 2022-12-14 | 0.035 |
| 2022-12-15 | 0.034 |
| 2022-12-16 | 0.035 |
| 2022-12-19 | 0.036 |
| 2022-12-20 | 0.037 |
| 2022-12-21 | 0.037 |
| 2022-12-22 | 0.037 |
| 2022-12-23 | 0.038 |
| 2022-12-26 | 0.038 |
| 2022-12-27 | 0.038 |
| 2022-12-28 | 0.039 |
| 2022-12-29 | 0.038 |
| 2022-12-30 | 0.039 |
| 2023-01-02 | 0.039 |
| 2023-01-03 | 0.038 |
| 2023-01-04 | 0.037 |
| 2023-01-05 | 0.037 |
| 2023-01-06 | 0.036 |
| 2023-01-09 | 0.035 |
| 2023-01-10 | 0.036 |
| 2023-01-11 | 0.035 |
| 2023-01-12 | 0.034 |
| 2023-01-13 | 0.035 |
| 2023-01-16 | 0.035 |
| 2023-01-17 | 0.035 |
| 2023-01-18 | 0.034 |
| 2023-01-19 | 0.034 |
| 2023-01-20 | 0.035 |
| 2023-01-23 | 0.035 |
| 2023-01-24 | 0.035 |
| 2023-01-25 | 0.035 |
| 2023-01-26 | 0.035 |
| 2023-01-27 | 0.035 |
| 2023-01-30 | 0.036 |
| 2023-01-31 | 0.035 |
| 2023-02-01 | 0.034 |
| 2023-02-02 | 0.034 |
| 2023-02-03 | 0.035 |
| 2023-02-06 | 0.036 |
| 2023-02-07 | 0.037 |
| 2023-02-08 | 0.036 |
| 2023-02-09 | 0.037 |
| 2023-02-10 | 0.037 |
| 2023-02-13 | 0.037 |
| 2023-02-14 | 0.038 |
| 2023-02-15 | 0.038 |
| 2023-02-16 | 0.039 |
| 2023-02-17 | 0.038 |
| 2023-02-20 | 0.038 |
| 2023-02-21 | 0.04 |
| 2023-02-22 | 0.039 |
| 2023-02-23 | 0.039 |
| 2023-02-24 | 0.04 |
| 2023-02-27 | 0.039 |
| 2023-02-28 | 0.039 |
| 2023-03-01 | 0.04 |
| 2023-03-02 | 0.041 |
| 2023-03-03 | 0.04 |
| 2023-03-06 | 0.04 |
| 2023-03-07 | 0.04 |
| 2023-03-08 | 0.04 |
| 2023-03-09 | 0.039 |
| 2023-03-10 | 0.037 |
| 2023-03-13 | 0.036 |
| 2023-03-14 | 0.036 |
| 2023-03-15 | 0.035 |
| 2023-03-16 | 0.036 |
| 2023-03-17 | 0.034 |
| 2023-03-20 | 0.035 |
| 2023-03-21 | 0.036 |
| 2023-03-22 | 0.035 |
| 2023-03-23 | 0.034 |
| 2023-03-24 | 0.034 |
| 2023-03-27 | 0.035 |
| 2023-03-28 | 0.036 |
| 2023-03-29 | 0.036 |
| 2023-03-30 | 0.036 |
| 2023-03-31 | 0.035 |
| 2023-04-03 | 0.034 |
| 2023-04-04 | 0.034 |
| 2023-04-05 | 0.033 |
| 2023-04-06 | 0.033 |
| 2023-04-07 | 0.034 |
| 2023-04-10 | 0.034 |
| 2023-04-11 | 0.034 |
| 2023-04-12 | 0.034 |
| 2023-04-13 | 0.034 |
| 2023-04-14 | 0.035 |
| 2023-04-17 | 0.036 |
| 2023-04-18 | 0.036 |
| 2023-04-19 | 0.036 |
| 2023-04-20 | 0.035 |
| 2023-04-21 | 0.036 |
| 2023-04-24 | 0.035 |
| 2023-04-25 | 0.034 |
| 2023-04-26 | 0.034 |
| 2023-04-27 | 0.035 |
| 2023-04-28 | 0.034 |
| 2023-05-01 | 0.036 |
| 2023-05-02 | 0.034 |
| 2023-05-03 | 0.034 |
| 2023-05-04 | 0.034 |
| 2023-05-05 | 0.034 |
| 2023-05-08 | 0.035 |
| 2023-05-09 | 0.035 |
| 2023-05-10 | 0.034 |
| 2023-05-11 | 0.034 |
| 2023-05-12 | 0.035 |
| 2023-05-15 | 0.035 |
| 2023-05-16 | 0.035 |
| 2023-05-17 | 0.036 |
| 2023-05-18 | 0.036 |
| 2023-05-19 | 0.037 |
| 2023-05-22 | 0.037 |
| 2023-05-23 | 0.037 |
| 2023-05-24 | 0.037 |
| 2023-05-25 | 0.038 |
| 2023-05-26 | 0.038 |
| 2023-05-29 | 0.038 |
| 2023-05-30 | 0.037 |
| 2023-05-31 | 0.036 |
| 2023-06-01 | 0.036 |
| 2023-06-02 | 0.037 |
| 2023-06-05 | 0.037 |
| 2023-06-06 | 0.037 |
| 2023-06-07 | 0.038 |
| 2023-06-08 | 0.037 |
| 2023-06-09 | 0.038 |
| 2023-06-12 | 0.037 |
| 2023-06-13 | 0.038 |
| 2023-06-14 | 0.038 |
| 2023-06-15 | 0.037 |
| 2023-06-16 | 0.038 |
| 2023-06-19 | 0.038 |
| 2023-06-20 | 0.037 |
| 2023-06-21 | 0.037 |
| 2023-06-22 | 0.038 |
| 2023-06-23 | 0.037 |
| 2023-06-26 | 0.037 |
| 2023-06-27 | 0.038 |
| 2023-06-28 | 0.037 |
| 2023-06-29 | 0.038 |
| 2023-06-30 | 0.038 |
| 2023-07-03 | 0.039 |
| 2023-07-04 | 0.039 |
| 2023-07-05 | 0.04 |
| 2023-07-06 | 0.04 |
| 2023-07-07 | 0.041 |
| 2023-07-10 | 0.04 |
| 2023-07-11 | 0.04 |
| 2023-07-12 | 0.039 |
| 2023-07-13 | 0.038 |
| 2023-07-14 | 0.038 |
| 2023-07-17 | 0.038 |
| 2023-07-18 | 0.038 |
| 2023-07-19 | 0.038 |
| 2023-07-20 | 0.038 |
| 2023-07-21 | 0.038 |
| 2023-07-24 | 0.039 |
| 2023-07-25 | 0.039 |
| 2023-07-26 | 0.039 |
| 2023-07-27 | 0.04 |
| 2023-07-28 | 0.04 |
| 2023-07-31 | 0.04 |
| 2023-08-01 | 0.04 |
| 2023-08-02 | 0.041 |
| 2023-08-03 | 0.042 |
| 2023-08-04 | 0.04 |
| 2023-08-07 | 0.041 |
| 2023-08-08 | 0.04 |
| 2023-08-09 | 0.04 |
| 2023-08-10 | 0.041 |
| 2023-08-11 | 0.042 |
| 2023-08-14 | 0.042 |
| 2023-08-15 | 0.042 |
| 2023-08-16 | 0.043 |
| 2023-08-17 | 0.043 |
| 2023-08-18 | 0.043 |
| 2023-08-21 | 0.043 |
| 2023-08-22 | 0.043 |
| 2023-08-23 | 0.042 |
| 2023-08-24 | 0.042 |
| 2023-08-25 | 0.042 |
| 2023-08-28 | 0.042 |
| 2023-08-29 | 0.041 |
| 2023-08-30 | 0.041 |
| 2023-08-31 | 0.041 |
| 2023-09-01 | 0.042 |
| 2023-09-04 | 0.042 |
| 2023-09-05 | 0.043 |
| 2023-09-06 | 0.043 |
| 2023-09-07 | 0.043 |
| 2023-09-08 | 0.043 |
| 2023-09-11 | 0.043 |
| 2023-09-12 | 0.043 |
| 2023-09-13 | 0.042 |
| 2023-09-14 | 0.043 |
| 2023-09-15 | 0.043 |
| 2023-09-18 | 0.043 |
| 2023-09-19 | 0.044 |
| 2023-09-20 | 0.044 |
| 2023-09-21 | 0.045 |
| 2023-09-22 | 0.044 |
| 2023-09-25 | 0.046 |
| 2023-09-26 | 0.046 |
| 2023-09-27 | 0.046 |
| 2023-09-28 | 0.046 |
| 2023-09-29 | 0.046 |
| 2023-10-02 | 0.047 |
| 2023-10-03 | 0.048 |
| 2023-10-04 | 0.047 |
| 2023-10-05 | 0.047 |
| 2023-10-06 | 0.048 |
| 2023-10-09 | 0.048 |
| 2023-10-10 | 0.047 |
| 2023-10-11 | 0.046 |
| 2023-10-12 | 0.047 |
| 2023-10-13 | 0.046 |
| 2023-10-16 | 0.047 |
| 2023-10-17 | 0.048 |
| 2023-10-18 | 0.049 |
| 2023-10-19 | 0.05 |
| 2023-10-20 | 0.049 |
| 2023-10-23 | 0.049 |
| 2023-10-24 | 0.048 |
| 2023-10-25 | 0.05 |
| 2023-10-26 | 0.049 |
| 2023-10-27 | 0.048 |
| 2023-10-30 | 0.049 |
| 2023-10-31 | 0.049 |
| 2023-11-01 | 0.048 |
| 2023-11-02 | 0.047 |
| 2023-11-03 | 0.046 |
| 2023-11-06 | 0.047 |
| 2023-11-07 | 0.046 |
| 2023-11-08 | 0.045 |
| 2023-11-09 | 0.046 |
| 2023-11-10 | 0.046 |
| 2023-11-13 | 0.046 |
| 2023-11-14 | 0.044 |
| 2023-11-15 | 0.045 |
| 2023-11-16 | 0.045 |
| 2023-11-17 | 0.044 |
| 2023-11-20 | 0.044 |
| 2023-11-21 | 0.044 |
| 2023-11-22 | 0.044 |
| 2023-11-23 | 0.044 |
| 2023-11-24 | 0.045 |
| 2023-11-27 | 0.044 |
| 2023-11-28 | 0.043 |
| 2023-11-29 | 0.043 |
| 2023-11-30 | 0.044 |
| 2023-12-01 | 0.042 |
| 2023-12-04 | 0.043 |
| 2023-12-05 | 0.042 |
| 2023-12-06 | 0.041 |
| 2023-12-07 | 0.041 |
| 2023-12-08 | 0.042 |
| 2023-12-11 | 0.042 |
| 2023-12-12 | 0.042 |
| 2023-12-13 | 0.04 |
| 2023-12-14 | 0.039 |
| 2023-12-15 | 0.039 |
| 2023-12-18 | 0.04 |
| 2023-12-19 | 0.039 |
| 2023-12-20 | 0.039 |
| 2023-12-21 | 0.039 |
| 2023-12-22 | 0.039 |
| 2023-12-25 | 0.039 |
| 2023-12-26 | 0.039 |
| 2023-12-27 | 0.038 |
| 2023-12-28 | 0.038 |
| 2023-12-29 | 0.039 |